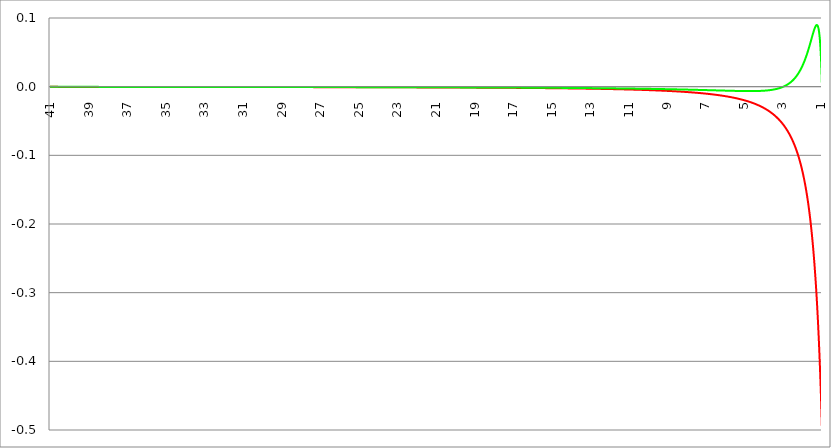
| Category | Series 1 | Series 0 | Series 2 |
|---|---|---|---|
| 41.0 | 0 | 0 |  |
| 40.98 | 0 | 0 |  |
| 40.96 | 0 | 0 |  |
| 40.94 | 0 | 0 |  |
| 40.91999999999999 | 0 | 0 |  |
| 40.89999999999998 | 0 | 0 |  |
| 40.87999999999998 | 0 | 0 |  |
| 40.85999999999998 | 0 | 0 |  |
| 40.83999999999997 | 0 | 0 |  |
| 40.81999999999997 | 0 | 0 |  |
| 40.79999999999996 | 0 | 0 |  |
| 40.77999999999996 | 0 | 0 |  |
| 40.75999999999996 | 0 | 0 |  |
| 40.73999999999995 | 0 | 0 |  |
| 40.71999999999995 | 0 | 0 |  |
| 40.69999999999995 | 0 | 0 |  |
| 40.67999999999994 | 0 | 0 |  |
| 40.65999999999994 | 0 | 0 |  |
| 40.63999999999994 | 0 | 0 |  |
| 40.61999999999994 | 0 | 0 |  |
| 40.59999999999993 | 0 | 0 |  |
| 40.57999999999993 | 0 | 0 |  |
| 40.55999999999993 | 0 | 0 |  |
| 40.53999999999992 | 0 | 0 |  |
| 40.51999999999992 | 0 | 0 |  |
| 40.49999999999992 | 0 | 0 |  |
| 40.47999999999992 | 0 | 0 |  |
| 40.45999999999992 | 0 | 0 |  |
| 40.43999999999991 | 0 | 0 |  |
| 40.41999999999991 | 0 | 0 |  |
| 40.3999999999999 | 0 | 0 |  |
| 40.3799999999999 | 0 | 0 |  |
| 40.3599999999999 | 0 | 0 |  |
| 40.3399999999999 | 0 | 0 |  |
| 40.3199999999999 | 0 | 0 |  |
| 40.2999999999999 | 0 | 0 |  |
| 40.27999999999988 | 0 | 0 |  |
| 40.25999999999988 | 0 | 0 |  |
| 40.23999999999988 | 0 | 0 |  |
| 40.21999999999987 | 0 | 0 |  |
| 40.19999999999987 | 0 | 0 |  |
| 40.17999999999987 | 0 | 0 |  |
| 40.15999999999987 | 0 | 0 |  |
| 40.13999999999986 | 0 | 0 |  |
| 40.11999999999986 | 0 | 0 |  |
| 40.09999999999985 | 0 | 0 |  |
| 40.07999999999985 | 0 | 0 |  |
| 40.05999999999985 | 0 | 0 |  |
| 40.03999999999984 | 0 | 0 |  |
| 40.01999999999984 | 0 | 0 |  |
| 39.99999999999984 | 0 | 0 |  |
| 39.97999999999984 | 0 | 0 |  |
| 39.95999999999984 | 0 | 0 |  |
| 39.93999999999983 | 0 | 0 |  |
| 39.91999999999983 | 0 | 0 |  |
| 39.89999999999982 | 0 | 0 |  |
| 39.87999999999982 | 0 | 0 |  |
| 39.85999999999982 | 0 | 0 |  |
| 39.83999999999982 | 0 | 0 |  |
| 39.81999999999982 | 0 | 0 |  |
| 39.7999999999998 | 0 | 0 |  |
| 39.7799999999998 | 0 | 0 |  |
| 39.7599999999998 | 0 | 0 |  |
| 39.7399999999998 | 0 | 0 |  |
| 39.7199999999998 | 0 | 0 |  |
| 39.6999999999998 | 0 | 0 |  |
| 39.6799999999998 | 0 | 0 |  |
| 39.6599999999998 | 0 | 0 |  |
| 39.63999999999978 | 0 | 0 |  |
| 39.61999999999978 | 0 | 0 |  |
| 39.59999999999978 | 0 | 0 |  |
| 39.57999999999977 | 0 | 0 |  |
| 39.55999999999977 | 0 | 0 |  |
| 39.53999999999977 | 0 | 0 |  |
| 39.51999999999977 | 0 | 0 |  |
| 39.49999999999976 | 0 | 0 |  |
| 39.47999999999976 | 0 | 0 |  |
| 39.45999999999976 | 0 | 0 |  |
| 39.43999999999975 | 0 | 0 |  |
| 39.41999999999975 | 0 | 0 |  |
| 39.39999999999974 | 0 | 0 |  |
| 39.37999999999974 | 0 | 0 |  |
| 39.35999999999974 | 0 | 0 |  |
| 39.33999999999974 | 0 | 0 |  |
| 39.31999999999974 | 0 | 0 |  |
| 39.29999999999973 | 0 | 0 |  |
| 39.27999999999973 | 0 | 0 |  |
| 39.25999999999972 | 0 | 0 |  |
| 39.23999999999972 | 0 | 0 |  |
| 39.21999999999972 | 0 | 0 |  |
| 39.19999999999971 | 0 | 0 |  |
| 39.17999999999971 | 0 | 0 |  |
| 39.15999999999971 | 0 | 0 |  |
| 39.1399999999997 | 0 | 0 |  |
| 39.1199999999997 | 0 | 0 |  |
| 39.0999999999997 | 0 | 0 |  |
| 39.0799999999997 | 0 | 0 |  |
| 39.0599999999997 | 0 | 0 |  |
| 39.0399999999997 | 0 | 0 |  |
| 39.0199999999997 | 0 | 0 |  |
| 38.99999999999969 | 0 | 0 |  |
| 38.97999999999968 | 0 | 0 |  |
| 38.95999999999968 | 0 | 0 |  |
| 38.93999999999968 | 0 | 0 |  |
| 38.91999999999967 | 0 | 0 |  |
| 38.89999999999967 | 0 | 0 |  |
| 38.87999999999967 | 0 | 0 |  |
| 38.85999999999967 | 0 | 0 |  |
| 38.83999999999966 | 0 | 0 |  |
| 38.81999999999966 | 0 | 0 |  |
| 38.79999999999965 | 0 | 0 |  |
| 38.77999999999965 | 0 | 0 |  |
| 38.75999999999965 | 0 | 0 |  |
| 38.73999999999964 | 0 | 0 |  |
| 38.71999999999964 | 0 | 0 |  |
| 38.69999999999964 | 0 | 0 |  |
| 38.67999999999964 | 0 | 0 |  |
| 38.65999999999963 | 0 | 0 |  |
| 38.63999999999963 | 0 | 0 |  |
| 38.61999999999963 | 0 | 0 |  |
| 38.59999999999962 | 0 | 0 |  |
| 38.57999999999962 | 0 | 0 |  |
| 38.55999999999962 | 0 | 0 |  |
| 38.53999999999962 | 0 | 0 |  |
| 38.51999999999961 | 0 | 0 |  |
| 38.49999999999961 | 0 | 0 |  |
| 38.47999999999961 | 0 | 0 |  |
| 38.4599999999996 | 0 | 0 |  |
| 38.4399999999996 | 0 | 0 |  |
| 38.4199999999996 | 0 | 0 |  |
| 38.3999999999996 | 0 | 0 |  |
| 38.3799999999996 | 0 | 0 |  |
| 38.35999999999959 | 0 | 0 |  |
| 38.33999999999958 | 0 | 0 |  |
| 38.31999999999958 | 0 | 0 |  |
| 38.29999999999957 | 0 | 0 |  |
| 38.27999999999957 | 0 | 0 |  |
| 38.25999999999957 | 0 | 0 |  |
| 38.23999999999957 | 0 | 0 |  |
| 38.21999999999957 | 0 | 0 |  |
| 38.19999999999956 | 0 | 0 |  |
| 38.17999999999956 | 0 | 0 |  |
| 38.15999999999956 | 0 | 0 |  |
| 38.13999999999955 | 0 | 0 |  |
| 38.11999999999955 | 0 | 0 |  |
| 38.09999999999954 | 0 | 0 |  |
| 38.07999999999954 | 0 | 0 |  |
| 38.05999999999954 | 0 | 0 |  |
| 38.03999999999954 | 0 | 0 |  |
| 38.01999999999953 | 0 | 0 |  |
| 37.99999999999953 | 0 | 0 |  |
| 37.97999999999953 | 0 | 0 |  |
| 37.95999999999952 | 0 | 0 |  |
| 37.93999999999952 | 0 | 0 |  |
| 37.91999999999952 | 0 | 0 |  |
| 37.89999999999952 | 0 | 0 |  |
| 37.87999999999951 | 0 | 0 |  |
| 37.85999999999951 | 0 | 0 |  |
| 37.83999999999951 | 0 | 0 |  |
| 37.8199999999995 | 0 | 0 |  |
| 37.7999999999995 | 0 | 0 |  |
| 37.7799999999995 | 0 | 0 |  |
| 37.7599999999995 | 0 | 0 |  |
| 37.7399999999995 | 0 | 0 |  |
| 37.71999999999949 | 0 | 0 |  |
| 37.69999999999948 | 0 | 0 |  |
| 37.67999999999948 | 0 | 0 |  |
| 37.65999999999948 | 0 | 0 |  |
| 37.63999999999947 | 0 | 0 |  |
| 37.61999999999947 | 0 | 0 |  |
| 37.59999999999947 | 0 | 0 |  |
| 37.57999999999947 | 0 | 0 |  |
| 37.55999999999946 | 0 | 0 |  |
| 37.53999999999946 | 0 | 0 |  |
| 37.51999999999946 | 0 | 0 |  |
| 37.49999999999945 | 0 | 0 |  |
| 37.47999999999945 | 0 | 0 |  |
| 37.45999999999945 | 0 | 0 |  |
| 37.43999999999944 | 0 | 0 |  |
| 37.41999999999944 | 0 | 0 |  |
| 37.39999999999944 | 0 | 0 |  |
| 37.37999999999943 | 0 | 0 |  |
| 37.35999999999943 | 0 | 0 |  |
| 37.33999999999943 | 0 | 0 |  |
| 37.31999999999942 | 0 | 0 |  |
| 37.29999999999942 | 0 | 0 |  |
| 37.27999999999942 | 0 | 0 |  |
| 37.25999999999942 | 0 | 0 |  |
| 37.23999999999941 | 0 | 0 |  |
| 37.21999999999941 | 0 | 0 |  |
| 37.1999999999994 | 0 | 0 |  |
| 37.1799999999994 | 0 | 0 |  |
| 37.1599999999994 | 0 | 0 |  |
| 37.1399999999994 | 0 | 0 |  |
| 37.1199999999994 | 0 | 0 |  |
| 37.0999999999994 | 0 | 0 |  |
| 37.07999999999939 | 0 | 0 |  |
| 37.05999999999938 | 0 | 0 |  |
| 37.03999999999938 | 0 | 0 |  |
| 37.01999999999938 | 0 | 0 |  |
| 36.99999999999937 | 0 | 0 |  |
| 36.97999999999937 | 0 | 0 |  |
| 36.95999999999937 | 0 | 0 |  |
| 36.93999999999937 | 0 | 0 |  |
| 36.91999999999936 | 0 | 0 |  |
| 36.89999999999936 | 0 | 0 |  |
| 36.87999999999936 | 0 | 0 |  |
| 36.85999999999935 | 0 | 0 |  |
| 36.83999999999935 | 0 | 0 |  |
| 36.81999999999935 | 0 | 0 |  |
| 36.79999999999934 | 0 | 0 |  |
| 36.77999999999934 | 0 | 0 |  |
| 36.75999999999934 | 0 | 0 |  |
| 36.73999999999933 | 0 | 0 |  |
| 36.71999999999933 | 0 | 0 |  |
| 36.69999999999932 | 0 | 0 |  |
| 36.67999999999932 | 0 | 0 |  |
| 36.65999999999932 | 0 | 0 |  |
| 36.63999999999932 | 0 | 0 |  |
| 36.61999999999932 | 0 | 0 |  |
| 36.59999999999931 | 0 | 0 |  |
| 36.57999999999931 | 0 | 0 |  |
| 36.55999999999931 | 0 | 0 |  |
| 36.5399999999993 | 0 | 0 |  |
| 36.5199999999993 | 0 | 0 |  |
| 36.4999999999993 | 0 | 0 |  |
| 36.4799999999993 | 0 | 0 |  |
| 36.4599999999993 | 0 | 0 |  |
| 36.43999999999929 | 0 | 0 |  |
| 36.41999999999928 | 0 | 0 |  |
| 36.39999999999928 | 0 | 0 |  |
| 36.37999999999928 | 0 | 0 |  |
| 36.35999999999927 | 0 | 0 |  |
| 36.33999999999927 | 0 | 0 |  |
| 36.31999999999927 | 0 | 0 |  |
| 36.29999999999926 | 0 | 0 |  |
| 36.27999999999926 | 0 | 0 |  |
| 36.25999999999926 | 0 | 0 |  |
| 36.23999999999925 | 0 | 0 |  |
| 36.21999999999925 | 0 | 0 |  |
| 36.19999999999924 | 0 | 0 |  |
| 36.17999999999924 | 0 | 0 |  |
| 36.15999999999924 | 0 | 0 |  |
| 36.13999999999924 | 0 | 0 |  |
| 36.11999999999924 | 0 | 0 |  |
| 36.09999999999923 | 0 | 0 |  |
| 36.07999999999923 | 0 | 0 |  |
| 36.05999999999923 | 0 | 0 |  |
| 36.03999999999922 | 0 | 0 |  |
| 36.01999999999922 | 0 | 0 |  |
| 35.99999999999922 | 0 | 0 |  |
| 35.97999999999922 | 0 | 0 |  |
| 35.95999999999921 | 0 | 0 |  |
| 35.93999999999921 | 0 | 0 |  |
| 35.91999999999921 | 0 | 0 |  |
| 35.8999999999992 | 0 | 0 |  |
| 35.8799999999992 | 0 | 0 |  |
| 35.8599999999992 | 0 | 0 |  |
| 35.8399999999992 | 0 | 0 |  |
| 35.8199999999992 | 0 | 0 |  |
| 35.79999999999918 | 0 | 0 |  |
| 35.77999999999918 | 0 | 0 |  |
| 35.75999999999918 | 0 | 0 |  |
| 35.73999999999917 | 0 | 0 |  |
| 35.71999999999917 | 0 | 0 |  |
| 35.69999999999917 | 0 | 0 |  |
| 35.67999999999917 | 0 | 0 |  |
| 35.65999999999917 | 0 | 0 |  |
| 35.63999999999916 | 0 | 0 |  |
| 35.61999999999916 | 0 | 0 |  |
| 35.59999999999915 | 0 | 0 |  |
| 35.57999999999915 | 0 | 0 |  |
| 35.55999999999915 | 0 | 0 |  |
| 35.53999999999914 | 0 | 0 |  |
| 35.51999999999914 | 0 | 0 |  |
| 35.49999999999914 | 0 | 0 |  |
| 35.47999999999914 | 0 | 0 |  |
| 35.45999999999913 | 0 | 0 |  |
| 35.43999999999913 | 0 | 0 |  |
| 35.41999999999913 | 0 | 0 |  |
| 35.39999999999912 | 0 | 0 |  |
| 35.37999999999912 | 0 | 0 |  |
| 35.35999999999912 | 0 | 0 |  |
| 35.33999999999912 | 0 | 0 |  |
| 35.31999999999911 | 0 | 0 |  |
| 35.2999999999991 | 0 | 0 |  |
| 35.2799999999991 | 0 | 0 |  |
| 35.2599999999991 | 0 | 0 |  |
| 35.2399999999991 | 0 | 0 |  |
| 35.2199999999991 | 0 | 0 |  |
| 35.1999999999991 | 0 | 0 |  |
| 35.1799999999991 | 0 | 0 |  |
| 35.15999999999909 | 0 | 0 |  |
| 35.13999999999908 | 0 | 0 |  |
| 35.11999999999908 | 0 | 0 |  |
| 35.09999999999907 | 0 | 0 |  |
| 35.07999999999907 | 0 | 0 |  |
| 35.05999999999907 | 0 | 0 |  |
| 35.03999999999907 | 0 | 0 |  |
| 35.01999999999907 | 0 | 0 |  |
| 34.99999999999906 | 0 | 0 |  |
| 34.97999999999906 | 0 | 0 |  |
| 34.95999999999906 | 0 | 0 |  |
| 34.93999999999905 | 0 | 0 |  |
| 34.91999999999905 | 0 | 0 |  |
| 34.89999999999904 | 0 | 0 |  |
| 34.87999999999904 | 0 | 0 |  |
| 34.85999999999904 | 0 | 0 |  |
| 34.83999999999904 | 0 | 0 |  |
| 34.81999999999903 | 0 | 0 |  |
| 34.79999999999903 | 0 | 0 |  |
| 34.77999999999902 | 0 | 0 |  |
| 34.75999999999902 | 0 | 0 |  |
| 34.73999999999902 | 0 | 0 |  |
| 34.71999999999902 | 0 | 0 |  |
| 34.69999999999901 | 0 | 0 |  |
| 34.67999999999901 | 0 | 0 |  |
| 34.65999999999901 | 0 | 0 |  |
| 34.639999999999 | 0 | 0 |  |
| 34.619999999999 | 0 | 0 |  |
| 34.599999999999 | 0 | 0 |  |
| 34.579999999999 | 0 | 0 |  |
| 34.559999999999 | 0 | 0 |  |
| 34.539999999999 | 0 | 0 |  |
| 34.51999999999899 | 0 | 0 |  |
| 34.49999999999898 | 0 | 0 |  |
| 34.47999999999898 | 0 | 0 |  |
| 34.45999999999898 | 0 | 0 |  |
| 34.43999999999897 | 0 | 0 |  |
| 34.41999999999897 | 0 | 0 |  |
| 34.39999999999897 | 0 | 0 |  |
| 34.37999999999897 | 0 | 0 |  |
| 34.35999999999896 | 0 | 0 |  |
| 34.33999999999896 | 0 | 0 |  |
| 34.31999999999896 | 0 | 0 |  |
| 34.29999999999895 | 0 | 0 |  |
| 34.27999999999894 | 0 | 0 |  |
| 34.25999999999894 | 0 | 0 |  |
| 34.23999999999894 | 0 | 0 |  |
| 34.21999999999894 | 0 | 0 |  |
| 34.19999999999893 | 0 | 0 |  |
| 34.17999999999893 | 0 | 0 |  |
| 34.15999999999893 | 0 | 0 |  |
| 34.13999999999892 | 0 | 0 |  |
| 34.11999999999892 | 0 | 0 |  |
| 34.09999999999892 | 0 | 0 |  |
| 34.07999999999892 | 0 | 0 |  |
| 34.05999999999892 | 0 | 0 |  |
| 34.03999999999891 | 0 | 0 |  |
| 34.01999999999891 | 0 | 0 |  |
| 33.9999999999989 | 0 | 0 |  |
| 33.9799999999989 | 0 | 0 |  |
| 33.9599999999989 | 0 | 0 |  |
| 33.9399999999989 | 0 | 0 |  |
| 33.9199999999989 | 0 | 0 |  |
| 33.8999999999989 | 0 | 0 |  |
| 33.87999999999889 | 0 | 0 |  |
| 33.85999999999888 | 0 | 0 |  |
| 33.83999999999888 | 0 | 0 |  |
| 33.81999999999888 | 0 | 0 |  |
| 33.79999999999887 | 0 | 0 |  |
| 33.77999999999887 | 0 | 0 |  |
| 33.75999999999887 | 0 | 0 |  |
| 33.73999999999886 | 0 | 0 |  |
| 33.71999999999886 | 0 | 0 |  |
| 33.69999999999885 | 0 | 0 |  |
| 33.67999999999885 | 0 | 0 |  |
| 33.65999999999885 | 0 | 0 |  |
| 33.63999999999884 | 0 | 0 |  |
| 33.61999999999884 | 0 | 0 |  |
| 33.59999999999884 | 0 | 0 |  |
| 33.57999999999884 | 0 | 0 |  |
| 33.55999999999884 | 0 | 0 |  |
| 33.53999999999883 | 0 | 0 |  |
| 33.51999999999883 | 0 | 0 |  |
| 33.49999999999882 | 0 | 0 |  |
| 33.47999999999882 | 0 | 0 |  |
| 33.45999999999882 | 0 | 0 |  |
| 33.43999999999882 | 0 | 0 |  |
| 33.41999999999882 | 0 | 0 |  |
| 33.39999999999881 | 0 | 0 |  |
| 33.37999999999881 | 0 | 0 |  |
| 33.35999999999881 | 0 | 0 |  |
| 33.3399999999988 | 0 | 0 |  |
| 33.3199999999988 | 0 | 0 |  |
| 33.2999999999988 | 0 | 0 |  |
| 33.2799999999988 | 0 | 0 |  |
| 33.2599999999988 | 0 | 0 |  |
| 33.23999999999878 | 0 | 0 |  |
| 33.21999999999878 | 0 | 0 |  |
| 33.19999999999878 | 0 | 0 |  |
| 33.17999999999877 | 0 | 0 |  |
| 33.15999999999877 | 0 | 0 |  |
| 33.13999999999877 | 0 | 0 |  |
| 33.11999999999877 | 0 | 0 |  |
| 33.09999999999876 | 0 | 0 |  |
| 33.07999999999876 | 0 | 0 |  |
| 33.05999999999876 | 0 | 0 |  |
| 33.03999999999875 | 0 | 0 |  |
| 33.01999999999875 | 0 | 0 |  |
| 32.99999999999874 | 0 | 0 |  |
| 32.97999999999874 | 0 | 0 |  |
| 32.95999999999874 | 0 | 0 |  |
| 32.93999999999874 | 0 | 0 |  |
| 32.91999999999874 | 0 | 0 |  |
| 32.89999999999873 | 0 | 0 |  |
| 32.87999999999873 | 0 | 0 |  |
| 32.85999999999873 | 0 | 0 |  |
| 32.83999999999872 | 0 | 0 |  |
| 32.81999999999872 | 0 | 0 |  |
| 32.79999999999871 | 0 | 0 |  |
| 32.77999999999871 | 0 | 0 |  |
| 32.75999999999871 | 0 | 0 |  |
| 32.7399999999987 | 0 | 0 |  |
| 32.7199999999987 | 0 | 0 |  |
| 32.6999999999987 | 0 | 0 |  |
| 32.6799999999987 | 0 | 0 |  |
| 32.6599999999987 | 0 | 0 |  |
| 32.6399999999987 | 0 | 0 |  |
| 32.61999999999869 | 0 | 0 |  |
| 32.59999999999869 | 0 | 0 |  |
| 32.57999999999868 | 0 | 0 |  |
| 32.55999999999868 | 0 | 0 |  |
| 32.53999999999868 | 0 | 0 |  |
| 32.51999999999867 | 0 | 0 |  |
| 32.49999999999867 | 0 | 0 |  |
| 32.47999999999867 | 0 | 0 |  |
| 32.45999999999866 | 0 | 0 |  |
| 32.43999999999866 | 0 | 0 |  |
| 32.41999999999866 | 0 | 0 |  |
| 32.39999999999866 | 0 | 0 |  |
| 32.37999999999865 | 0 | 0 |  |
| 32.35999999999865 | 0 | 0 |  |
| 32.33999999999865 | 0 | 0 |  |
| 32.31999999999864 | 0 | 0 |  |
| 32.29999999999864 | 0 | 0 |  |
| 32.27999999999864 | 0 | 0 |  |
| 32.25999999999863 | 0 | 0 |  |
| 32.23999999999863 | 0 | 0 |  |
| 32.21999999999863 | 0 | 0 |  |
| 32.19999999999862 | 0 | 0 |  |
| 32.17999999999862 | 0 | 0 |  |
| 32.15999999999862 | 0 | 0 |  |
| 32.13999999999861 | 0 | 0 |  |
| 32.11999999999861 | 0 | 0 |  |
| 32.09999999999861 | 0 | 0 |  |
| 32.07999999999861 | 0 | 0 |  |
| 32.0599999999986 | 0 | 0 |  |
| 32.0399999999986 | 0 | 0 |  |
| 32.0199999999986 | 0 | 0 |  |
| 31.9999999999986 | 0 | 0 |  |
| 31.9799999999986 | 0 | 0 |  |
| 31.9599999999986 | 0 | 0 |  |
| 31.9399999999986 | 0 | 0 |  |
| 31.9199999999986 | 0 | 0 |  |
| 31.8999999999986 | 0 | 0 |  |
| 31.8799999999986 | 0 | 0 |  |
| 31.8599999999986 | 0 | 0 |  |
| 31.8399999999986 | 0 | 0 |  |
| 31.8199999999986 | 0 | 0 |  |
| 31.7999999999986 | 0 | 0 |  |
| 31.7799999999986 | 0 | 0 |  |
| 31.7599999999986 | 0 | 0 |  |
| 31.7399999999986 | 0 | 0 |  |
| 31.7199999999986 | 0 | 0 |  |
| 31.6999999999986 | 0 | 0 |  |
| 31.6799999999986 | 0 | 0 |  |
| 31.6599999999986 | 0 | 0 |  |
| 31.6399999999986 | 0 | 0 |  |
| 31.6199999999986 | -0.001 | 0 |  |
| 31.59999999999861 | -0.001 | 0 |  |
| 31.57999999999861 | -0.001 | 0 |  |
| 31.55999999999861 | -0.001 | 0 |  |
| 31.53999999999861 | -0.001 | 0 |  |
| 31.51999999999861 | -0.001 | 0 |  |
| 31.49999999999861 | -0.001 | 0 |  |
| 31.47999999999861 | -0.001 | 0 |  |
| 31.45999999999861 | -0.001 | 0 |  |
| 31.43999999999861 | -0.001 | 0 |  |
| 31.41999999999861 | -0.001 | 0 |  |
| 31.39999999999861 | -0.001 | 0 |  |
| 31.37999999999861 | -0.001 | 0 |  |
| 31.35999999999861 | -0.001 | 0 |  |
| 31.33999999999861 | -0.001 | 0 |  |
| 31.31999999999861 | -0.001 | 0 |  |
| 31.29999999999861 | -0.001 | 0 |  |
| 31.27999999999861 | -0.001 | 0 |  |
| 31.25999999999861 | -0.001 | 0 |  |
| 31.23999999999861 | -0.001 | 0 |  |
| 31.21999999999861 | -0.001 | 0 |  |
| 31.19999999999861 | -0.001 | 0 |  |
| 31.17999999999861 | -0.001 | 0 |  |
| 31.15999999999861 | -0.001 | 0 |  |
| 31.13999999999861 | -0.001 | 0 |  |
| 31.11999999999861 | -0.001 | 0 |  |
| 31.09999999999862 | -0.001 | 0 |  |
| 31.07999999999862 | -0.001 | 0 |  |
| 31.05999999999862 | -0.001 | 0 |  |
| 31.03999999999862 | -0.001 | 0 |  |
| 31.01999999999862 | -0.001 | 0 |  |
| 30.99999999999862 | -0.001 | 0 |  |
| 30.97999999999862 | -0.001 | 0 |  |
| 30.95999999999862 | -0.001 | 0 |  |
| 30.93999999999862 | -0.001 | 0 |  |
| 30.91999999999862 | -0.001 | 0 |  |
| 30.89999999999862 | -0.001 | 0 |  |
| 30.87999999999862 | -0.001 | 0 |  |
| 30.85999999999862 | -0.001 | 0 |  |
| 30.83999999999862 | -0.001 | 0 |  |
| 30.81999999999862 | -0.001 | 0 |  |
| 30.79999999999862 | -0.001 | 0 |  |
| 30.77999999999862 | -0.001 | 0 |  |
| 30.75999999999862 | -0.001 | 0 |  |
| 30.73999999999862 | -0.001 | 0 |  |
| 30.71999999999862 | -0.001 | 0 |  |
| 30.69999999999862 | -0.001 | 0 |  |
| 30.67999999999862 | -0.001 | 0 |  |
| 30.65999999999862 | -0.001 | 0 |  |
| 30.63999999999862 | -0.001 | 0 |  |
| 30.61999999999862 | -0.001 | 0 |  |
| 30.59999999999863 | -0.001 | 0 |  |
| 30.57999999999863 | -0.001 | 0 |  |
| 30.55999999999863 | -0.001 | 0 |  |
| 30.53999999999863 | -0.001 | 0 |  |
| 30.51999999999863 | -0.001 | 0 |  |
| 30.49999999999863 | -0.001 | 0 |  |
| 30.47999999999863 | -0.001 | 0 |  |
| 30.45999999999863 | -0.001 | 0 |  |
| 30.43999999999863 | -0.001 | 0 |  |
| 30.41999999999863 | -0.001 | 0 |  |
| 30.39999999999863 | -0.001 | 0 |  |
| 30.37999999999863 | -0.001 | 0 |  |
| 30.35999999999863 | -0.001 | 0 |  |
| 30.33999999999863 | -0.001 | 0 |  |
| 30.31999999999863 | -0.001 | 0 |  |
| 30.29999999999863 | -0.001 | 0 |  |
| 30.27999999999863 | -0.001 | 0 |  |
| 30.25999999999863 | -0.001 | 0 |  |
| 30.23999999999863 | -0.001 | 0 |  |
| 30.21999999999863 | -0.001 | 0 |  |
| 30.19999999999864 | -0.001 | 0 |  |
| 30.17999999999864 | -0.001 | 0 |  |
| 30.15999999999864 | -0.001 | 0 |  |
| 30.13999999999864 | -0.001 | 0 |  |
| 30.11999999999864 | -0.001 | 0 |  |
| 30.09999999999864 | -0.001 | 0 |  |
| 30.07999999999864 | -0.001 | 0 |  |
| 30.05999999999864 | -0.001 | 0 |  |
| 30.03999999999864 | -0.001 | 0 |  |
| 30.01999999999864 | -0.001 | 0 |  |
| 29.99999999999864 | -0.001 | 0 |  |
| 29.97999999999864 | -0.001 | 0 |  |
| 29.95999999999864 | -0.001 | 0 |  |
| 29.93999999999864 | -0.001 | 0 |  |
| 29.91999999999864 | -0.001 | 0 |  |
| 29.89999999999864 | -0.001 | 0 |  |
| 29.87999999999864 | -0.001 | 0 |  |
| 29.85999999999864 | -0.001 | 0 |  |
| 29.83999999999864 | -0.001 | 0 |  |
| 29.81999999999864 | -0.001 | 0 |  |
| 29.79999999999864 | -0.001 | 0 |  |
| 29.77999999999864 | -0.001 | 0 |  |
| 29.75999999999864 | -0.001 | 0 |  |
| 29.73999999999864 | -0.001 | 0 |  |
| 29.71999999999865 | -0.001 | 0 |  |
| 29.69999999999865 | -0.001 | 0 |  |
| 29.67999999999865 | -0.001 | 0 |  |
| 29.65999999999865 | -0.001 | 0 |  |
| 29.63999999999865 | -0.001 | 0 |  |
| 29.61999999999865 | -0.001 | 0 |  |
| 29.59999999999865 | -0.001 | 0 |  |
| 29.57999999999865 | -0.001 | 0 |  |
| 29.55999999999865 | -0.001 | 0 |  |
| 29.53999999999865 | -0.001 | 0 |  |
| 29.51999999999865 | -0.001 | 0 |  |
| 29.49999999999865 | -0.001 | 0 |  |
| 29.47999999999865 | -0.001 | 0 |  |
| 29.45999999999865 | -0.001 | 0 |  |
| 29.43999999999865 | -0.001 | -0.001 |  |
| 29.41999999999865 | -0.001 | -0.001 |  |
| 29.39999999999865 | -0.001 | -0.001 |  |
| 29.37999999999865 | -0.001 | -0.001 |  |
| 29.35999999999865 | -0.001 | -0.001 |  |
| 29.33999999999865 | -0.001 | -0.001 |  |
| 29.31999999999865 | -0.001 | -0.001 |  |
| 29.29999999999865 | -0.001 | -0.001 |  |
| 29.27999999999865 | -0.001 | -0.001 |  |
| 29.25999999999866 | -0.001 | -0.001 |  |
| 29.23999999999866 | -0.001 | -0.001 |  |
| 29.21999999999866 | -0.001 | -0.001 |  |
| 29.19999999999866 | -0.001 | -0.001 |  |
| 29.17999999999866 | -0.001 | -0.001 |  |
| 29.15999999999866 | -0.001 | -0.001 |  |
| 29.13999999999866 | -0.001 | -0.001 |  |
| 29.11999999999866 | -0.001 | -0.001 |  |
| 29.09999999999866 | -0.001 | -0.001 |  |
| 29.07999999999866 | -0.001 | -0.001 |  |
| 29.05999999999866 | -0.001 | -0.001 |  |
| 29.03999999999866 | -0.001 | -0.001 |  |
| 29.01999999999866 | -0.001 | -0.001 |  |
| 28.99999999999866 | -0.001 | -0.001 |  |
| 28.97999999999866 | -0.001 | -0.001 |  |
| 28.95999999999866 | -0.001 | -0.001 |  |
| 28.93999999999866 | -0.001 | -0.001 |  |
| 28.91999999999866 | -0.001 | -0.001 |  |
| 28.89999999999866 | -0.001 | -0.001 |  |
| 28.87999999999866 | -0.001 | -0.001 |  |
| 28.85999999999866 | -0.001 | -0.001 |  |
| 28.83999999999866 | -0.001 | -0.001 |  |
| 28.81999999999866 | -0.001 | -0.001 |  |
| 28.79999999999866 | -0.001 | -0.001 |  |
| 28.77999999999867 | -0.001 | -0.001 |  |
| 28.75999999999867 | -0.001 | -0.001 |  |
| 28.73999999999867 | -0.001 | -0.001 |  |
| 28.71999999999867 | -0.001 | -0.001 |  |
| 28.69999999999867 | -0.001 | -0.001 |  |
| 28.67999999999867 | -0.001 | -0.001 |  |
| 28.65999999999867 | -0.001 | -0.001 |  |
| 28.63999999999867 | -0.001 | -0.001 |  |
| 28.61999999999867 | -0.001 | -0.001 |  |
| 28.59999999999867 | -0.001 | -0.001 |  |
| 28.57999999999867 | -0.001 | -0.001 |  |
| 28.55999999999867 | -0.001 | -0.001 |  |
| 28.53999999999867 | -0.001 | -0.001 |  |
| 28.51999999999867 | -0.001 | -0.001 |  |
| 28.49999999999867 | -0.001 | -0.001 |  |
| 28.47999999999867 | -0.001 | -0.001 |  |
| 28.45999999999867 | -0.001 | -0.001 |  |
| 28.43999999999867 | -0.001 | -0.001 |  |
| 28.41999999999867 | -0.001 | -0.001 |  |
| 28.39999999999867 | -0.001 | -0.001 |  |
| 28.37999999999867 | -0.001 | -0.001 |  |
| 28.35999999999867 | -0.001 | -0.001 |  |
| 28.33999999999867 | -0.001 | -0.001 |  |
| 28.31999999999867 | -0.001 | -0.001 |  |
| 28.29999999999868 | -0.001 | -0.001 |  |
| 28.27999999999868 | -0.001 | -0.001 |  |
| 28.25999999999868 | -0.001 | -0.001 |  |
| 28.23999999999868 | -0.001 | -0.001 |  |
| 28.21999999999868 | -0.001 | -0.001 |  |
| 28.19999999999868 | -0.001 | -0.001 |  |
| 28.17999999999868 | -0.001 | -0.001 |  |
| 28.15999999999868 | -0.001 | -0.001 |  |
| 28.13999999999868 | -0.001 | -0.001 |  |
| 28.11999999999868 | -0.001 | -0.001 |  |
| 28.09999999999868 | -0.001 | -0.001 |  |
| 28.07999999999868 | -0.001 | -0.001 |  |
| 28.05999999999868 | -0.001 | -0.001 |  |
| 28.03999999999868 | -0.001 | -0.001 |  |
| 28.01999999999868 | -0.001 | -0.001 |  |
| 27.99999999999868 | -0.001 | -0.001 |  |
| 27.97999999999868 | -0.001 | -0.001 |  |
| 27.95999999999868 | -0.001 | -0.001 |  |
| 27.93999999999868 | -0.001 | -0.001 |  |
| 27.91999999999868 | -0.001 | -0.001 |  |
| 27.89999999999868 | -0.001 | -0.001 |  |
| 27.87999999999868 | -0.001 | -0.001 |  |
| 27.85999999999868 | -0.001 | -0.001 |  |
| 27.83999999999868 | -0.001 | -0.001 |  |
| 27.81999999999868 | -0.001 | -0.001 |  |
| 27.79999999999869 | -0.001 | -0.001 |  |
| 27.77999999999869 | -0.001 | -0.001 |  |
| 27.75999999999869 | -0.001 | -0.001 |  |
| 27.73999999999869 | -0.001 | -0.001 |  |
| 27.71999999999869 | -0.001 | -0.001 |  |
| 27.69999999999869 | -0.001 | -0.001 |  |
| 27.67999999999869 | -0.001 | -0.001 |  |
| 27.65999999999869 | -0.001 | -0.001 |  |
| 27.63999999999869 | -0.001 | -0.001 |  |
| 27.61999999999869 | -0.001 | -0.001 |  |
| 27.5999999999987 | -0.001 | -0.001 |  |
| 27.5799999999987 | -0.001 | -0.001 |  |
| 27.5599999999987 | -0.001 | -0.001 |  |
| 27.5399999999987 | -0.001 | -0.001 |  |
| 27.5199999999987 | -0.001 | -0.001 |  |
| 27.49999999999869 | -0.001 | -0.001 |  |
| 27.47999999999869 | -0.001 | -0.001 |  |
| 27.45999999999869 | -0.001 | -0.001 |  |
| 27.43999999999869 | -0.001 | -0.001 |  |
| 27.41999999999869 | -0.001 | -0.001 |  |
| 27.39999999999869 | -0.001 | -0.001 |  |
| 27.3799999999987 | -0.001 | -0.001 |  |
| 27.3599999999987 | -0.001 | -0.001 |  |
| 27.3399999999987 | -0.001 | -0.001 |  |
| 27.3199999999987 | -0.001 | -0.001 |  |
| 27.2999999999987 | -0.001 | -0.001 |  |
| 27.2799999999987 | -0.001 | -0.001 |  |
| 27.2599999999987 | -0.001 | -0.001 |  |
| 27.2399999999987 | -0.001 | -0.001 |  |
| 27.2199999999987 | -0.001 | -0.001 |  |
| 27.1999999999987 | -0.001 | -0.001 |  |
| 27.1799999999987 | -0.001 | -0.001 |  |
| 27.1599999999987 | -0.001 | -0.001 |  |
| 27.1399999999987 | -0.001 | -0.001 |  |
| 27.1199999999987 | -0.001 | -0.001 |  |
| 27.0999999999987 | -0.001 | -0.001 |  |
| 27.0799999999987 | -0.001 | -0.001 |  |
| 27.0599999999987 | -0.001 | -0.001 |  |
| 27.0399999999987 | -0.001 | -0.001 |  |
| 27.0199999999987 | -0.001 | -0.001 |  |
| 26.9999999999987 | -0.001 | -0.001 |  |
| 26.9799999999987 | -0.001 | -0.001 |  |
| 26.9599999999987 | -0.001 | -0.001 |  |
| 26.9399999999987 | -0.001 | -0.001 |  |
| 26.9199999999987 | -0.001 | -0.001 |  |
| 26.89999999999871 | -0.001 | -0.001 |  |
| 26.87999999999871 | -0.001 | -0.001 |  |
| 26.85999999999871 | -0.001 | -0.001 |  |
| 26.83999999999871 | -0.001 | -0.001 |  |
| 26.81999999999871 | -0.001 | -0.001 |  |
| 26.79999999999871 | -0.001 | -0.001 |  |
| 26.77999999999871 | -0.001 | -0.001 |  |
| 26.75999999999871 | -0.001 | -0.001 |  |
| 26.73999999999871 | -0.001 | -0.001 |  |
| 26.71999999999871 | -0.001 | -0.001 |  |
| 26.69999999999871 | -0.001 | -0.001 |  |
| 26.67999999999871 | -0.001 | -0.001 |  |
| 26.65999999999871 | -0.001 | -0.001 |  |
| 26.63999999999871 | -0.001 | -0.001 |  |
| 26.61999999999871 | -0.001 | -0.001 |  |
| 26.59999999999871 | -0.001 | -0.001 |  |
| 26.57999999999871 | -0.001 | -0.001 |  |
| 26.55999999999871 | -0.001 | -0.001 |  |
| 26.53999999999871 | -0.001 | -0.001 |  |
| 26.51999999999871 | -0.001 | -0.001 |  |
| 26.49999999999871 | -0.001 | -0.001 |  |
| 26.47999999999871 | -0.001 | -0.001 |  |
| 26.45999999999871 | -0.001 | -0.001 |  |
| 26.43999999999872 | -0.001 | -0.001 |  |
| 26.41999999999872 | -0.001 | -0.001 |  |
| 26.39999999999872 | -0.001 | -0.001 |  |
| 26.37999999999872 | -0.001 | -0.001 |  |
| 26.35999999999872 | -0.001 | -0.001 |  |
| 26.33999999999872 | -0.001 | -0.001 |  |
| 26.31999999999872 | -0.001 | -0.001 |  |
| 26.29999999999872 | -0.001 | -0.001 |  |
| 26.27999999999872 | -0.001 | -0.001 |  |
| 26.25999999999872 | -0.001 | -0.001 |  |
| 26.23999999999872 | -0.001 | -0.001 |  |
| 26.21999999999872 | -0.001 | -0.001 |  |
| 26.19999999999872 | -0.001 | -0.001 |  |
| 26.17999999999872 | -0.001 | -0.001 |  |
| 26.15999999999872 | -0.001 | -0.001 |  |
| 26.13999999999872 | -0.001 | -0.001 |  |
| 26.11999999999872 | -0.001 | -0.001 |  |
| 26.09999999999872 | -0.001 | -0.001 |  |
| 26.07999999999872 | -0.001 | -0.001 |  |
| 26.05999999999872 | -0.001 | -0.001 |  |
| 26.03999999999872 | -0.001 | -0.001 |  |
| 26.01999999999872 | -0.001 | -0.001 |  |
| 25.99999999999872 | -0.001 | -0.001 |  |
| 25.97999999999872 | -0.001 | -0.001 |  |
| 25.95999999999873 | -0.001 | -0.001 |  |
| 25.93999999999873 | -0.001 | -0.001 |  |
| 25.91999999999873 | -0.001 | -0.001 |  |
| 25.89999999999873 | -0.001 | -0.001 |  |
| 25.87999999999873 | -0.001 | -0.001 |  |
| 25.85999999999873 | -0.001 | -0.001 |  |
| 25.83999999999873 | -0.001 | -0.001 |  |
| 25.81999999999873 | -0.001 | -0.001 |  |
| 25.79999999999873 | -0.001 | -0.001 |  |
| 25.77999999999873 | -0.001 | -0.001 |  |
| 25.75999999999873 | -0.001 | -0.001 |  |
| 25.73999999999873 | -0.001 | -0.001 |  |
| 25.71999999999873 | -0.001 | -0.001 |  |
| 25.69999999999873 | -0.001 | -0.001 |  |
| 25.67999999999873 | -0.001 | -0.001 |  |
| 25.65999999999873 | -0.001 | -0.001 |  |
| 25.63999999999873 | -0.001 | -0.001 |  |
| 25.61999999999873 | -0.001 | -0.001 |  |
| 25.59999999999873 | -0.001 | -0.001 |  |
| 25.57999999999873 | -0.001 | -0.001 |  |
| 25.55999999999873 | -0.001 | -0.001 |  |
| 25.53999999999873 | -0.001 | -0.001 |  |
| 25.51999999999873 | -0.001 | -0.001 |  |
| 25.49999999999874 | -0.001 | -0.001 |  |
| 25.47999999999874 | -0.001 | -0.001 |  |
| 25.45999999999874 | -0.001 | -0.001 |  |
| 25.43999999999874 | -0.001 | -0.001 |  |
| 25.41999999999874 | -0.001 | -0.001 |  |
| 25.39999999999874 | -0.001 | -0.001 |  |
| 25.37999999999874 | -0.001 | -0.001 |  |
| 25.35999999999874 | -0.001 | -0.001 |  |
| 25.33999999999874 | -0.001 | -0.001 |  |
| 25.31999999999874 | -0.001 | -0.001 |  |
| 25.29999999999874 | -0.001 | -0.001 |  |
| 25.27999999999874 | -0.001 | -0.001 |  |
| 25.25999999999874 | -0.001 | -0.001 |  |
| 25.23999999999874 | -0.001 | -0.001 |  |
| 25.21999999999874 | -0.001 | -0.001 |  |
| 25.19999999999874 | -0.001 | -0.001 |  |
| 25.17999999999874 | -0.001 | -0.001 |  |
| 25.15999999999874 | -0.001 | -0.001 |  |
| 25.13999999999874 | -0.001 | -0.001 |  |
| 25.11999999999874 | -0.001 | -0.001 |  |
| 25.09999999999874 | -0.001 | -0.001 |  |
| 25.07999999999874 | -0.001 | -0.001 |  |
| 25.05999999999874 | -0.001 | -0.001 |  |
| 25.03999999999875 | -0.001 | -0.001 |  |
| 25.01999999999875 | -0.001 | -0.001 |  |
| 24.99999999999875 | -0.001 | -0.001 |  |
| 24.97999999999875 | -0.001 | -0.001 |  |
| 24.95999999999875 | -0.001 | -0.001 |  |
| 24.93999999999875 | -0.001 | -0.001 |  |
| 24.91999999999875 | -0.001 | -0.001 |  |
| 24.89999999999875 | -0.001 | -0.001 |  |
| 24.87999999999875 | -0.001 | -0.001 |  |
| 24.85999999999875 | -0.001 | -0.001 |  |
| 24.83999999999875 | -0.001 | -0.001 |  |
| 24.81999999999875 | -0.001 | -0.001 |  |
| 24.79999999999875 | -0.001 | -0.001 |  |
| 24.77999999999875 | -0.001 | -0.001 |  |
| 24.75999999999875 | -0.001 | -0.001 |  |
| 24.73999999999875 | -0.001 | -0.001 |  |
| 24.71999999999875 | -0.001 | -0.001 |  |
| 24.69999999999875 | -0.001 | -0.001 |  |
| 24.67999999999875 | -0.001 | -0.001 |  |
| 24.65999999999875 | -0.001 | -0.001 |  |
| 24.63999999999875 | -0.001 | -0.001 |  |
| 24.61999999999875 | -0.001 | -0.001 |  |
| 24.59999999999875 | -0.001 | -0.001 |  |
| 24.57999999999875 | -0.001 | -0.001 |  |
| 24.55999999999876 | -0.001 | -0.001 |  |
| 24.53999999999876 | -0.001 | -0.001 |  |
| 24.51999999999876 | -0.001 | -0.001 |  |
| 24.49999999999876 | -0.001 | -0.001 |  |
| 24.47999999999876 | -0.001 | -0.001 |  |
| 24.45999999999876 | -0.001 | -0.001 |  |
| 24.43999999999876 | -0.001 | -0.001 |  |
| 24.41999999999876 | -0.001 | -0.001 |  |
| 24.39999999999876 | -0.001 | -0.001 |  |
| 24.37999999999876 | -0.001 | -0.001 |  |
| 24.35999999999876 | -0.001 | -0.001 |  |
| 24.33999999999876 | -0.001 | -0.001 |  |
| 24.31999999999876 | -0.001 | -0.001 |  |
| 24.29999999999876 | -0.001 | -0.001 |  |
| 24.27999999999876 | -0.001 | -0.001 |  |
| 24.25999999999876 | -0.001 | -0.001 |  |
| 24.23999999999876 | -0.001 | -0.001 |  |
| 24.21999999999876 | -0.001 | -0.001 |  |
| 24.19999999999876 | -0.001 | -0.001 |  |
| 24.17999999999876 | -0.001 | -0.001 |  |
| 24.15999999999876 | -0.001 | -0.001 |  |
| 24.13999999999876 | -0.001 | -0.001 |  |
| 24.11999999999876 | -0.001 | -0.001 |  |
| 24.09999999999877 | -0.001 | -0.001 |  |
| 24.07999999999877 | -0.001 | -0.001 |  |
| 24.05999999999877 | -0.001 | -0.001 |  |
| 24.03999999999877 | -0.001 | -0.001 |  |
| 24.01999999999877 | -0.001 | -0.001 |  |
| 23.99999999999877 | -0.001 | -0.001 |  |
| 23.97999999999877 | -0.001 | -0.001 |  |
| 23.95999999999877 | -0.001 | -0.001 |  |
| 23.93999999999877 | -0.001 | -0.001 |  |
| 23.91999999999877 | -0.001 | -0.001 |  |
| 23.89999999999877 | -0.001 | -0.001 |  |
| 23.87999999999877 | -0.001 | -0.001 |  |
| 23.85999999999877 | -0.001 | -0.001 |  |
| 23.83999999999877 | -0.001 | -0.001 |  |
| 23.81999999999877 | -0.001 | -0.001 |  |
| 23.79999999999877 | -0.001 | -0.001 |  |
| 23.77999999999877 | -0.001 | -0.001 |  |
| 23.75999999999877 | -0.001 | -0.001 |  |
| 23.73999999999877 | -0.001 | -0.001 |  |
| 23.71999999999877 | -0.001 | -0.001 |  |
| 23.69999999999877 | -0.001 | -0.001 |  |
| 23.67999999999877 | -0.001 | -0.001 |  |
| 23.65999999999877 | -0.001 | -0.001 |  |
| 23.63999999999877 | -0.001 | -0.001 |  |
| 23.61999999999877 | -0.001 | -0.001 |  |
| 23.59999999999878 | -0.001 | -0.001 |  |
| 23.57999999999878 | -0.001 | -0.001 |  |
| 23.55999999999878 | -0.001 | -0.001 |  |
| 23.53999999999878 | -0.001 | -0.001 |  |
| 23.51999999999878 | -0.001 | -0.001 |  |
| 23.49999999999878 | -0.001 | -0.001 |  |
| 23.47999999999878 | -0.001 | -0.001 |  |
| 23.45999999999878 | -0.001 | -0.001 |  |
| 23.43999999999878 | -0.001 | -0.001 |  |
| 23.41999999999878 | -0.001 | -0.001 |  |
| 23.39999999999878 | -0.001 | -0.001 |  |
| 23.37999999999878 | -0.001 | -0.001 |  |
| 23.35999999999878 | -0.001 | -0.001 |  |
| 23.33999999999878 | -0.001 | -0.001 |  |
| 23.31999999999878 | -0.001 | -0.001 |  |
| 23.29999999999878 | -0.001 | -0.001 |  |
| 23.27999999999878 | -0.001 | -0.001 |  |
| 23.25999999999878 | -0.001 | -0.001 |  |
| 23.23999999999878 | -0.001 | -0.001 |  |
| 23.21999999999878 | -0.001 | -0.001 |  |
| 23.19999999999878 | -0.001 | -0.001 |  |
| 23.17999999999878 | -0.001 | -0.001 |  |
| 23.15999999999878 | -0.001 | -0.001 |  |
| 23.13999999999878 | -0.001 | -0.001 |  |
| 23.11999999999878 | -0.001 | -0.001 |  |
| 23.09999999999879 | -0.001 | -0.001 |  |
| 23.07999999999879 | -0.001 | -0.001 |  |
| 23.05999999999879 | -0.001 | -0.001 |  |
| 23.03999999999879 | -0.001 | -0.001 |  |
| 23.01999999999879 | -0.001 | -0.001 |  |
| 22.99999999999879 | -0.001 | -0.001 |  |
| 22.97999999999879 | -0.001 | -0.001 |  |
| 22.95999999999879 | -0.001 | -0.001 |  |
| 22.93999999999879 | -0.001 | -0.001 |  |
| 22.9199999999988 | -0.001 | -0.001 |  |
| 22.8999999999988 | -0.001 | -0.001 |  |
| 22.8799999999988 | -0.001 | -0.001 |  |
| 22.8599999999988 | -0.001 | -0.001 |  |
| 22.8399999999988 | -0.001 | -0.001 |  |
| 22.8199999999988 | -0.001 | -0.001 |  |
| 22.79999999999879 | -0.001 | -0.001 |  |
| 22.77999999999879 | -0.001 | -0.001 |  |
| 22.75999999999879 | -0.001 | -0.001 |  |
| 22.73999999999879 | -0.001 | -0.001 |  |
| 22.71999999999879 | -0.001 | -0.001 |  |
| 22.69999999999879 | -0.001 | -0.001 |  |
| 22.6799999999988 | -0.001 | -0.001 |  |
| 22.6599999999988 | -0.001 | -0.001 |  |
| 22.6399999999988 | -0.001 | -0.001 |  |
| 22.6199999999988 | -0.001 | -0.001 |  |
| 22.5999999999988 | -0.001 | -0.001 |  |
| 22.5799999999988 | -0.001 | -0.001 |  |
| 22.5599999999988 | -0.001 | -0.001 |  |
| 22.5399999999988 | -0.001 | -0.001 |  |
| 22.5199999999988 | -0.001 | -0.001 |  |
| 22.4999999999988 | -0.001 | -0.001 |  |
| 22.4799999999988 | -0.001 | -0.001 |  |
| 22.4599999999988 | -0.001 | -0.001 |  |
| 22.4399999999988 | -0.001 | -0.001 |  |
| 22.4199999999988 | -0.001 | -0.001 |  |
| 22.3999999999988 | -0.001 | -0.001 |  |
| 22.3799999999988 | -0.001 | -0.001 |  |
| 22.3599999999988 | -0.001 | -0.001 |  |
| 22.3399999999988 | -0.001 | -0.001 |  |
| 22.3199999999988 | -0.001 | -0.001 |  |
| 22.2999999999988 | -0.001 | -0.001 |  |
| 22.2799999999988 | -0.001 | -0.001 |  |
| 22.2599999999988 | -0.001 | -0.001 |  |
| 22.2399999999988 | -0.001 | -0.001 |  |
| 22.21999999999881 | -0.001 | -0.001 |  |
| 22.19999999999881 | -0.001 | -0.001 |  |
| 22.17999999999881 | -0.001 | -0.001 |  |
| 22.15999999999881 | -0.001 | -0.001 |  |
| 22.13999999999881 | -0.001 | -0.001 |  |
| 22.11999999999881 | -0.001 | -0.001 |  |
| 22.09999999999881 | -0.001 | -0.001 |  |
| 22.07999999999881 | -0.001 | -0.001 |  |
| 22.05999999999881 | -0.001 | -0.001 |  |
| 22.03999999999881 | -0.001 | -0.001 |  |
| 22.01999999999881 | -0.001 | -0.001 |  |
| 21.99999999999881 | -0.001 | -0.001 |  |
| 21.97999999999881 | -0.001 | -0.001 |  |
| 21.95999999999881 | -0.001 | -0.001 |  |
| 21.93999999999881 | -0.001 | -0.001 |  |
| 21.91999999999881 | -0.001 | -0.001 |  |
| 21.89999999999881 | -0.001 | -0.001 |  |
| 21.87999999999881 | -0.001 | -0.001 |  |
| 21.85999999999881 | -0.001 | -0.001 |  |
| 21.83999999999881 | -0.001 | -0.001 |  |
| 21.81999999999881 | -0.001 | -0.001 |  |
| 21.79999999999881 | -0.001 | -0.001 |  |
| 21.77999999999881 | -0.001 | -0.001 |  |
| 21.75999999999881 | -0.001 | -0.001 |  |
| 21.73999999999882 | -0.001 | -0.001 |  |
| 21.71999999999882 | -0.001 | -0.001 |  |
| 21.69999999999882 | -0.001 | -0.001 |  |
| 21.67999999999882 | -0.001 | -0.001 |  |
| 21.65999999999882 | -0.001 | -0.001 |  |
| 21.63999999999882 | -0.001 | -0.001 |  |
| 21.61999999999882 | -0.001 | -0.001 |  |
| 21.59999999999882 | -0.001 | -0.001 |  |
| 21.57999999999882 | -0.001 | -0.001 |  |
| 21.55999999999882 | -0.001 | -0.001 |  |
| 21.53999999999882 | -0.001 | -0.001 |  |
| 21.51999999999882 | -0.001 | -0.001 |  |
| 21.49999999999882 | -0.001 | -0.001 |  |
| 21.47999999999882 | -0.001 | -0.001 |  |
| 21.45999999999882 | -0.001 | -0.001 |  |
| 21.43999999999882 | -0.001 | -0.001 |  |
| 21.41999999999882 | -0.001 | -0.001 |  |
| 21.39999999999882 | -0.001 | -0.001 |  |
| 21.37999999999882 | -0.001 | -0.001 |  |
| 21.35999999999882 | -0.001 | -0.001 |  |
| 21.33999999999882 | -0.001 | -0.001 |  |
| 21.31999999999882 | -0.001 | -0.001 |  |
| 21.29999999999882 | -0.001 | -0.001 |  |
| 21.27999999999883 | -0.001 | -0.001 |  |
| 21.25999999999883 | -0.001 | -0.001 |  |
| 21.23999999999883 | -0.001 | -0.001 |  |
| 21.21999999999883 | -0.001 | -0.001 |  |
| 21.19999999999883 | -0.001 | -0.001 |  |
| 21.17999999999883 | -0.001 | -0.001 |  |
| 21.15999999999883 | -0.001 | -0.001 |  |
| 21.13999999999883 | -0.001 | -0.001 |  |
| 21.11999999999883 | -0.001 | -0.001 |  |
| 21.09999999999883 | -0.001 | -0.001 |  |
| 21.07999999999883 | -0.001 | -0.001 |  |
| 21.05999999999883 | -0.001 | -0.001 |  |
| 21.03999999999883 | -0.001 | -0.001 |  |
| 21.01999999999883 | -0.001 | -0.001 |  |
| 20.99999999999883 | -0.001 | -0.001 |  |
| 20.97999999999883 | -0.001 | -0.001 |  |
| 20.95999999999883 | -0.001 | -0.001 |  |
| 20.93999999999883 | -0.001 | -0.001 |  |
| 20.91999999999883 | -0.001 | -0.001 |  |
| 20.89999999999883 | -0.001 | -0.001 |  |
| 20.87999999999883 | -0.001 | -0.001 |  |
| 20.85999999999883 | -0.001 | -0.001 |  |
| 20.83999999999883 | -0.001 | -0.001 |  |
| 20.81999999999883 | -0.001 | -0.001 |  |
| 20.79999999999884 | -0.001 | -0.001 |  |
| 20.77999999999884 | -0.001 | -0.001 |  |
| 20.75999999999884 | -0.001 | -0.001 |  |
| 20.73999999999884 | -0.001 | -0.001 |  |
| 20.71999999999884 | -0.001 | -0.001 |  |
| 20.69999999999884 | -0.001 | -0.001 |  |
| 20.67999999999884 | -0.001 | -0.001 |  |
| 20.65999999999884 | -0.001 | -0.001 |  |
| 20.63999999999884 | -0.001 | -0.001 |  |
| 20.61999999999884 | -0.001 | -0.001 |  |
| 20.59999999999884 | -0.001 | -0.001 |  |
| 20.57999999999884 | -0.001 | -0.001 |  |
| 20.55999999999884 | -0.001 | -0.001 |  |
| 20.53999999999884 | -0.001 | -0.001 |  |
| 20.51999999999884 | -0.001 | -0.001 |  |
| 20.49999999999884 | -0.001 | -0.001 |  |
| 20.47999999999884 | -0.001 | -0.001 |  |
| 20.45999999999884 | -0.001 | -0.001 |  |
| 20.43999999999884 | -0.001 | -0.001 |  |
| 20.41999999999884 | -0.001 | -0.001 |  |
| 20.39999999999884 | -0.001 | -0.001 |  |
| 20.37999999999884 | -0.001 | -0.001 |  |
| 20.35999999999884 | -0.001 | -0.001 |  |
| 20.33999999999885 | -0.001 | -0.001 |  |
| 20.31999999999885 | -0.001 | -0.001 |  |
| 20.29999999999885 | -0.001 | -0.001 |  |
| 20.27999999999885 | -0.001 | -0.001 |  |
| 20.25999999999885 | -0.001 | -0.001 |  |
| 20.23999999999885 | -0.001 | -0.001 |  |
| 20.21999999999885 | -0.001 | -0.001 |  |
| 20.19999999999885 | -0.001 | -0.001 |  |
| 20.17999999999885 | -0.001 | -0.001 |  |
| 20.15999999999885 | -0.001 | -0.001 |  |
| 20.13999999999885 | -0.001 | -0.001 |  |
| 20.11999999999885 | -0.001 | -0.001 |  |
| 20.09999999999885 | -0.001 | -0.001 |  |
| 20.07999999999885 | -0.001 | -0.001 |  |
| 20.05999999999885 | -0.001 | -0.001 |  |
| 20.03999999999885 | -0.001 | -0.001 |  |
| 20.01999999999885 | -0.001 | -0.001 |  |
| 19.99999999999885 | -0.001 | -0.001 |  |
| 19.97999999999885 | -0.001 | -0.001 |  |
| 19.95999999999885 | -0.001 | -0.001 |  |
| 19.93999999999885 | -0.001 | -0.001 |  |
| 19.91999999999885 | -0.001 | -0.001 |  |
| 19.89999999999885 | -0.001 | -0.001 |  |
| 19.87999999999885 | -0.001 | -0.001 |  |
| 19.85999999999886 | -0.001 | -0.001 |  |
| 19.83999999999886 | -0.001 | -0.001 |  |
| 19.81999999999886 | -0.001 | -0.001 |  |
| 19.79999999999886 | -0.001 | -0.001 |  |
| 19.77999999999886 | -0.001 | -0.001 |  |
| 19.75999999999886 | -0.001 | -0.001 |  |
| 19.73999999999886 | -0.001 | -0.001 |  |
| 19.71999999999886 | -0.001 | -0.001 |  |
| 19.69999999999886 | -0.001 | -0.001 |  |
| 19.67999999999886 | -0.001 | -0.001 |  |
| 19.65999999999886 | -0.001 | -0.001 |  |
| 19.63999999999886 | -0.001 | -0.001 |  |
| 19.61999999999886 | -0.001 | -0.001 |  |
| 19.59999999999886 | -0.001 | -0.001 |  |
| 19.57999999999886 | -0.001 | -0.001 |  |
| 19.55999999999886 | -0.001 | -0.001 |  |
| 19.53999999999886 | -0.001 | -0.001 |  |
| 19.51999999999886 | -0.001 | -0.001 |  |
| 19.49999999999886 | -0.001 | -0.001 |  |
| 19.47999999999886 | -0.001 | -0.001 |  |
| 19.45999999999886 | -0.001 | -0.001 |  |
| 19.43999999999886 | -0.001 | -0.001 |  |
| 19.41999999999886 | -0.001 | -0.001 |  |
| 19.39999999999887 | -0.001 | -0.001 |  |
| 19.37999999999887 | -0.001 | -0.001 |  |
| 19.35999999999887 | -0.001 | -0.001 |  |
| 19.33999999999887 | -0.001 | -0.001 |  |
| 19.31999999999887 | -0.001 | -0.001 |  |
| 19.29999999999887 | -0.001 | -0.001 |  |
| 19.27999999999887 | -0.001 | -0.001 |  |
| 19.25999999999887 | -0.001 | -0.001 |  |
| 19.23999999999887 | -0.001 | -0.001 |  |
| 19.21999999999887 | -0.001 | -0.001 |  |
| 19.19999999999887 | -0.001 | -0.001 |  |
| 19.17999999999887 | -0.001 | -0.001 |  |
| 19.15999999999887 | -0.001 | -0.001 |  |
| 19.13999999999887 | -0.001 | -0.001 |  |
| 19.11999999999887 | -0.001 | -0.001 |  |
| 19.09999999999887 | -0.001 | -0.001 |  |
| 19.07999999999887 | -0.001 | -0.001 |  |
| 19.05999999999887 | -0.001 | -0.001 |  |
| 19.03999999999887 | -0.001 | -0.001 |  |
| 19.01999999999887 | -0.001 | -0.001 |  |
| 18.99999999999887 | -0.001 | -0.001 |  |
| 18.97999999999887 | -0.001 | -0.001 |  |
| 18.95999999999887 | -0.001 | -0.001 |  |
| 18.93999999999888 | -0.001 | -0.001 |  |
| 18.91999999999888 | -0.001 | -0.001 |  |
| 18.89999999999888 | -0.001 | -0.001 |  |
| 18.87999999999888 | -0.001 | -0.001 |  |
| 18.85999999999888 | -0.001 | -0.001 |  |
| 18.83999999999888 | -0.001 | -0.001 |  |
| 18.81999999999888 | -0.001 | -0.001 |  |
| 18.79999999999888 | -0.001 | -0.001 |  |
| 18.77999999999888 | -0.001 | -0.001 |  |
| 18.75999999999888 | -0.001 | -0.001 |  |
| 18.73999999999888 | -0.001 | -0.001 |  |
| 18.71999999999888 | -0.001 | -0.001 |  |
| 18.69999999999888 | -0.001 | -0.001 |  |
| 18.67999999999888 | -0.001 | -0.001 |  |
| 18.65999999999888 | -0.001 | -0.001 |  |
| 18.63999999999888 | -0.001 | -0.001 |  |
| 18.61999999999888 | -0.001 | -0.001 |  |
| 18.59999999999888 | -0.001 | -0.001 |  |
| 18.57999999999888 | -0.001 | -0.001 |  |
| 18.55999999999888 | -0.001 | -0.001 |  |
| 18.53999999999888 | -0.001 | -0.001 |  |
| 18.51999999999888 | -0.001 | -0.001 |  |
| 18.49999999999888 | -0.001 | -0.001 |  |
| 18.47999999999888 | -0.001 | -0.001 |  |
| 18.45999999999889 | -0.001 | -0.001 |  |
| 18.43999999999889 | -0.001 | -0.001 |  |
| 18.41999999999889 | -0.001 | -0.001 |  |
| 18.39999999999889 | -0.001 | -0.001 |  |
| 18.37999999999889 | -0.001 | -0.001 |  |
| 18.35999999999889 | -0.001 | -0.001 |  |
| 18.33999999999889 | -0.001 | -0.001 |  |
| 18.31999999999889 | -0.001 | -0.001 |  |
| 18.29999999999889 | -0.001 | -0.001 |  |
| 18.27999999999889 | -0.001 | -0.001 |  |
| 18.25999999999889 | -0.001 | -0.001 |  |
| 18.23999999999889 | -0.002 | -0.001 |  |
| 18.2199999999989 | -0.002 | -0.001 |  |
| 18.1999999999989 | -0.002 | -0.001 |  |
| 18.1799999999989 | -0.002 | -0.001 |  |
| 18.1599999999989 | -0.002 | -0.001 |  |
| 18.1399999999989 | -0.002 | -0.001 |  |
| 18.1199999999989 | -0.002 | -0.001 |  |
| 18.09999999999889 | -0.002 | -0.001 |  |
| 18.07999999999889 | -0.002 | -0.001 |  |
| 18.05999999999889 | -0.002 | -0.001 |  |
| 18.03999999999889 | -0.002 | -0.001 |  |
| 18.01999999999889 | -0.002 | -0.001 |  |
| 17.9999999999989 | -0.002 | -0.001 |  |
| 17.9799999999989 | -0.002 | -0.001 |  |
| 17.9599999999989 | -0.002 | -0.001 |  |
| 17.9399999999989 | -0.002 | -0.001 |  |
| 17.9199999999989 | -0.002 | -0.001 |  |
| 17.8999999999989 | -0.002 | -0.001 |  |
| 17.8799999999989 | -0.002 | -0.001 |  |
| 17.8599999999989 | -0.002 | -0.001 |  |
| 17.8399999999989 | -0.002 | -0.001 |  |
| 17.8199999999989 | -0.002 | -0.001 |  |
| 17.7999999999989 | -0.002 | -0.001 |  |
| 17.7799999999989 | -0.002 | -0.001 |  |
| 17.7599999999989 | -0.002 | -0.001 |  |
| 17.7399999999989 | -0.002 | -0.001 |  |
| 17.7199999999989 | -0.002 | -0.001 |  |
| 17.6999999999989 | -0.002 | -0.001 |  |
| 17.6799999999989 | -0.002 | -0.001 |  |
| 17.6599999999989 | -0.002 | -0.001 |  |
| 17.6399999999989 | -0.002 | -0.001 |  |
| 17.6199999999989 | -0.002 | -0.001 |  |
| 17.5999999999989 | -0.002 | -0.001 |  |
| 17.5799999999989 | -0.002 | -0.001 |  |
| 17.5599999999989 | -0.002 | -0.001 |  |
| 17.5399999999989 | -0.002 | -0.001 |  |
| 17.51999999999891 | -0.002 | -0.001 |  |
| 17.49999999999891 | -0.002 | -0.001 |  |
| 17.47999999999891 | -0.002 | -0.001 |  |
| 17.45999999999891 | -0.002 | -0.001 |  |
| 17.43999999999891 | -0.002 | -0.001 |  |
| 17.41999999999891 | -0.002 | -0.001 |  |
| 17.39999999999891 | -0.002 | -0.001 |  |
| 17.37999999999891 | -0.002 | -0.001 |  |
| 17.35999999999891 | -0.002 | -0.001 |  |
| 17.33999999999891 | -0.002 | -0.001 |  |
| 17.31999999999891 | -0.002 | -0.001 |  |
| 17.29999999999891 | -0.002 | -0.001 |  |
| 17.27999999999891 | -0.002 | -0.001 |  |
| 17.25999999999891 | -0.002 | -0.001 |  |
| 17.23999999999891 | -0.002 | -0.001 |  |
| 17.21999999999891 | -0.002 | -0.001 |  |
| 17.19999999999891 | -0.002 | -0.001 |  |
| 17.17999999999891 | -0.002 | -0.001 |  |
| 17.15999999999891 | -0.002 | -0.001 |  |
| 17.13999999999891 | -0.002 | -0.001 |  |
| 17.11999999999891 | -0.002 | -0.001 |  |
| 17.09999999999891 | -0.002 | -0.001 |  |
| 17.07999999999891 | -0.002 | -0.001 |  |
| 17.05999999999892 | -0.002 | -0.001 |  |
| 17.03999999999892 | -0.002 | -0.001 |  |
| 17.01999999999892 | -0.002 | -0.001 |  |
| 16.99999999999892 | -0.002 | -0.001 |  |
| 16.97999999999892 | -0.002 | -0.001 |  |
| 16.95999999999892 | -0.002 | -0.001 |  |
| 16.93999999999892 | -0.002 | -0.001 |  |
| 16.91999999999892 | -0.002 | -0.001 |  |
| 16.89999999999892 | -0.002 | -0.001 |  |
| 16.87999999999892 | -0.002 | -0.001 |  |
| 16.85999999999892 | -0.002 | -0.001 |  |
| 16.83999999999892 | -0.002 | -0.001 |  |
| 16.81999999999892 | -0.002 | -0.001 |  |
| 16.79999999999892 | -0.002 | -0.001 |  |
| 16.77999999999892 | -0.002 | -0.001 |  |
| 16.75999999999892 | -0.002 | -0.001 |  |
| 16.73999999999892 | -0.002 | -0.001 |  |
| 16.71999999999892 | -0.002 | -0.001 |  |
| 16.69999999999892 | -0.002 | -0.001 |  |
| 16.67999999999892 | -0.002 | -0.001 |  |
| 16.65999999999892 | -0.002 | -0.001 |  |
| 16.63999999999892 | -0.002 | -0.001 |  |
| 16.61999999999892 | -0.002 | -0.001 |  |
| 16.59999999999892 | -0.002 | -0.001 |  |
| 16.57999999999893 | -0.002 | -0.001 |  |
| 16.55999999999893 | -0.002 | -0.001 |  |
| 16.53999999999893 | -0.002 | -0.001 |  |
| 16.51999999999893 | -0.002 | -0.001 |  |
| 16.49999999999893 | -0.002 | -0.001 |  |
| 16.47999999999893 | -0.002 | -0.001 |  |
| 16.45999999999893 | -0.002 | -0.001 |  |
| 16.43999999999893 | -0.002 | -0.001 |  |
| 16.41999999999893 | -0.002 | -0.001 |  |
| 16.39999999999893 | -0.002 | -0.001 |  |
| 16.37999999999893 | -0.002 | -0.001 |  |
| 16.35999999999893 | -0.002 | -0.001 |  |
| 16.33999999999893 | -0.002 | -0.001 |  |
| 16.31999999999893 | -0.002 | -0.001 |  |
| 16.29999999999893 | -0.002 | -0.001 |  |
| 16.27999999999893 | -0.002 | -0.001 |  |
| 16.25999999999893 | -0.002 | -0.001 |  |
| 16.23999999999893 | -0.002 | -0.001 |  |
| 16.21999999999893 | -0.002 | -0.001 |  |
| 16.19999999999893 | -0.002 | -0.001 |  |
| 16.17999999999893 | -0.002 | -0.001 |  |
| 16.15999999999893 | -0.002 | -0.001 |  |
| 16.13999999999893 | -0.002 | -0.001 |  |
| 16.11999999999894 | -0.002 | -0.001 |  |
| 16.09999999999894 | -0.002 | -0.001 |  |
| 16.07999999999894 | -0.002 | -0.001 |  |
| 16.05999999999894 | -0.002 | -0.001 |  |
| 16.03999999999894 | -0.002 | -0.001 |  |
| 16.01999999999894 | -0.002 | -0.001 |  |
| 15.99999999999894 | -0.002 | -0.001 |  |
| 15.97999999999894 | -0.002 | -0.001 |  |
| 15.95999999999894 | -0.002 | -0.001 |  |
| 15.93999999999894 | -0.002 | -0.001 |  |
| 15.91999999999894 | -0.002 | -0.002 |  |
| 15.89999999999894 | -0.002 | -0.002 |  |
| 15.87999999999894 | -0.002 | -0.002 |  |
| 15.85999999999894 | -0.002 | -0.002 |  |
| 15.83999999999894 | -0.002 | -0.002 |  |
| 15.81999999999894 | -0.002 | -0.002 |  |
| 15.79999999999894 | -0.002 | -0.002 |  |
| 15.77999999999894 | -0.002 | -0.002 |  |
| 15.75999999999894 | -0.002 | -0.002 |  |
| 15.73999999999894 | -0.002 | -0.002 |  |
| 15.71999999999894 | -0.002 | -0.002 |  |
| 15.69999999999894 | -0.002 | -0.002 |  |
| 15.67999999999894 | -0.002 | -0.002 |  |
| 15.65999999999894 | -0.002 | -0.002 |  |
| 15.63999999999895 | -0.002 | -0.002 |  |
| 15.61999999999895 | -0.002 | -0.002 |  |
| 15.59999999999895 | -0.002 | -0.002 |  |
| 15.57999999999895 | -0.002 | -0.002 |  |
| 15.55999999999895 | -0.002 | -0.002 |  |
| 15.53999999999895 | -0.002 | -0.002 |  |
| 15.51999999999895 | -0.002 | -0.002 |  |
| 15.49999999999895 | -0.002 | -0.002 |  |
| 15.47999999999895 | -0.002 | -0.002 |  |
| 15.45999999999895 | -0.002 | -0.002 |  |
| 15.43999999999895 | -0.002 | -0.002 |  |
| 15.41999999999895 | -0.002 | -0.002 |  |
| 15.39999999999895 | -0.002 | -0.002 |  |
| 15.37999999999895 | -0.002 | -0.002 |  |
| 15.35999999999895 | -0.002 | -0.002 |  |
| 15.33999999999895 | -0.002 | -0.002 |  |
| 15.31999999999895 | -0.002 | -0.002 |  |
| 15.29999999999895 | -0.002 | -0.002 |  |
| 15.27999999999895 | -0.002 | -0.002 |  |
| 15.25999999999895 | -0.002 | -0.002 |  |
| 15.23999999999895 | -0.002 | -0.002 |  |
| 15.21999999999895 | -0.002 | -0.002 |  |
| 15.19999999999895 | -0.002 | -0.002 |  |
| 15.17999999999896 | -0.002 | -0.002 |  |
| 15.15999999999896 | -0.002 | -0.002 |  |
| 15.13999999999896 | -0.002 | -0.002 |  |
| 15.11999999999896 | -0.002 | -0.002 |  |
| 15.09999999999896 | -0.002 | -0.002 |  |
| 15.07999999999896 | -0.002 | -0.002 |  |
| 15.05999999999896 | -0.002 | -0.002 |  |
| 15.03999999999896 | -0.002 | -0.002 |  |
| 15.01999999999896 | -0.002 | -0.002 |  |
| 14.99999999999896 | -0.002 | -0.002 |  |
| 14.97999999999896 | -0.002 | -0.002 |  |
| 14.95999999999896 | -0.002 | -0.002 |  |
| 14.93999999999896 | -0.002 | -0.002 |  |
| 14.91999999999896 | -0.002 | -0.002 |  |
| 14.89999999999896 | -0.002 | -0.002 |  |
| 14.87999999999896 | -0.002 | -0.002 |  |
| 14.85999999999896 | -0.002 | -0.002 |  |
| 14.83999999999896 | -0.002 | -0.002 |  |
| 14.81999999999896 | -0.002 | -0.002 |  |
| 14.79999999999896 | -0.002 | -0.002 |  |
| 14.77999999999896 | -0.002 | -0.002 |  |
| 14.75999999999896 | -0.002 | -0.002 |  |
| 14.73999999999896 | -0.002 | -0.002 |  |
| 14.71999999999896 | -0.002 | -0.002 |  |
| 14.69999999999897 | -0.002 | -0.002 |  |
| 14.67999999999897 | -0.002 | -0.002 |  |
| 14.65999999999897 | -0.002 | -0.002 |  |
| 14.63999999999897 | -0.002 | -0.002 |  |
| 14.61999999999897 | -0.002 | -0.002 |  |
| 14.59999999999897 | -0.002 | -0.002 |  |
| 14.57999999999897 | -0.002 | -0.002 |  |
| 14.55999999999897 | -0.002 | -0.002 |  |
| 14.53999999999897 | -0.002 | -0.002 |  |
| 14.51999999999897 | -0.002 | -0.002 |  |
| 14.49999999999897 | -0.002 | -0.002 |  |
| 14.47999999999897 | -0.002 | -0.002 |  |
| 14.45999999999897 | -0.002 | -0.002 |  |
| 14.43999999999897 | -0.002 | -0.002 |  |
| 14.41999999999897 | -0.002 | -0.002 |  |
| 14.39999999999897 | -0.002 | -0.002 |  |
| 14.37999999999897 | -0.002 | -0.002 |  |
| 14.35999999999897 | -0.002 | -0.002 |  |
| 14.33999999999897 | -0.002 | -0.002 |  |
| 14.31999999999897 | -0.002 | -0.002 |  |
| 14.29999999999897 | -0.002 | -0.002 |  |
| 14.27999999999897 | -0.002 | -0.002 |  |
| 14.25999999999897 | -0.002 | -0.002 |  |
| 14.23999999999898 | -0.002 | -0.002 |  |
| 14.21999999999898 | -0.002 | -0.002 |  |
| 14.19999999999898 | -0.002 | -0.002 |  |
| 14.17999999999898 | -0.002 | -0.002 |  |
| 14.15999999999898 | -0.002 | -0.002 |  |
| 14.13999999999898 | -0.003 | -0.002 |  |
| 14.11999999999898 | -0.003 | -0.002 |  |
| 14.09999999999898 | -0.003 | -0.002 |  |
| 14.07999999999898 | -0.003 | -0.002 |  |
| 14.05999999999898 | -0.003 | -0.002 |  |
| 14.03999999999898 | -0.003 | -0.002 |  |
| 14.01999999999898 | -0.003 | -0.002 |  |
| 13.99999999999898 | -0.003 | -0.002 |  |
| 13.97999999999898 | -0.003 | -0.002 |  |
| 13.95999999999898 | -0.003 | -0.002 |  |
| 13.93999999999898 | -0.003 | -0.002 |  |
| 13.91999999999898 | -0.003 | -0.002 |  |
| 13.89999999999898 | -0.003 | -0.002 |  |
| 13.87999999999898 | -0.003 | -0.002 |  |
| 13.85999999999898 | -0.003 | -0.002 |  |
| 13.83999999999898 | -0.003 | -0.002 |  |
| 13.81999999999898 | -0.003 | -0.002 |  |
| 13.79999999999898 | -0.003 | -0.002 |  |
| 13.77999999999898 | -0.003 | -0.002 |  |
| 13.75999999999899 | -0.003 | -0.002 |  |
| 13.73999999999899 | -0.003 | -0.002 |  |
| 13.71999999999899 | -0.003 | -0.002 |  |
| 13.69999999999899 | -0.003 | -0.002 |  |
| 13.67999999999899 | -0.003 | -0.002 |  |
| 13.65999999999899 | -0.003 | -0.002 |  |
| 13.63999999999899 | -0.003 | -0.002 |  |
| 13.61999999999899 | -0.003 | -0.002 |  |
| 13.59999999999899 | -0.003 | -0.002 |  |
| 13.57999999999899 | -0.003 | -0.002 |  |
| 13.55999999999899 | -0.003 | -0.002 |  |
| 13.539999999999 | -0.003 | -0.002 |  |
| 13.519999999999 | -0.003 | -0.002 |  |
| 13.499999999999 | -0.003 | -0.002 |  |
| 13.479999999999 | -0.003 | -0.002 |  |
| 13.459999999999 | -0.003 | -0.002 |  |
| 13.439999999999 | -0.003 | -0.002 |  |
| 13.419999999999 | -0.003 | -0.002 |  |
| 13.399999999999 | -0.003 | -0.002 |  |
| 13.379999999999 | -0.003 | -0.002 |  |
| 13.359999999999 | -0.003 | -0.002 |  |
| 13.33999999999899 | -0.003 | -0.002 |  |
| 13.31999999999899 | -0.003 | -0.002 |  |
| 13.299999999999 | -0.003 | -0.002 |  |
| 13.279999999999 | -0.003 | -0.002 |  |
| 13.259999999999 | -0.003 | -0.002 |  |
| 13.239999999999 | -0.003 | -0.002 |  |
| 13.219999999999 | -0.003 | -0.002 |  |
| 13.199999999999 | -0.003 | -0.002 |  |
| 13.179999999999 | -0.003 | -0.002 |  |
| 13.159999999999 | -0.003 | -0.002 |  |
| 13.139999999999 | -0.003 | -0.002 |  |
| 13.119999999999 | -0.003 | -0.002 |  |
| 13.099999999999 | -0.003 | -0.002 |  |
| 13.079999999999 | -0.003 | -0.002 |  |
| 13.059999999999 | -0.003 | -0.002 |  |
| 13.039999999999 | -0.003 | -0.002 |  |
| 13.019999999999 | -0.003 | -0.002 |  |
| 12.999999999999 | -0.003 | -0.002 |  |
| 12.979999999999 | -0.003 | -0.002 |  |
| 12.959999999999 | -0.003 | -0.002 |  |
| 12.939999999999 | -0.003 | -0.002 |  |
| 12.919999999999 | -0.003 | -0.002 |  |
| 12.899999999999 | -0.003 | -0.002 |  |
| 12.879999999999 | -0.003 | -0.002 |  |
| 12.859999999999 | -0.003 | -0.002 |  |
| 12.83999999999901 | -0.003 | -0.002 |  |
| 12.81999999999901 | -0.003 | -0.002 |  |
| 12.79999999999901 | -0.003 | -0.002 |  |
| 12.77999999999901 | -0.003 | -0.002 |  |
| 12.75999999999901 | -0.003 | -0.002 |  |
| 12.73999999999901 | -0.003 | -0.002 |  |
| 12.71999999999901 | -0.003 | -0.002 |  |
| 12.69999999999901 | -0.003 | -0.002 |  |
| 12.67999999999901 | -0.003 | -0.002 |  |
| 12.65999999999901 | -0.003 | -0.002 |  |
| 12.63999999999901 | -0.003 | -0.002 |  |
| 12.61999999999901 | -0.003 | -0.002 |  |
| 12.59999999999901 | -0.003 | -0.002 |  |
| 12.57999999999901 | -0.003 | -0.002 |  |
| 12.55999999999901 | -0.003 | -0.002 |  |
| 12.53999999999901 | -0.003 | -0.002 |  |
| 12.51999999999901 | -0.003 | -0.002 |  |
| 12.49999999999901 | -0.003 | -0.002 |  |
| 12.47999999999901 | -0.003 | -0.002 |  |
| 12.45999999999901 | -0.003 | -0.002 |  |
| 12.43999999999901 | -0.003 | -0.002 |  |
| 12.41999999999901 | -0.003 | -0.002 |  |
| 12.39999999999901 | -0.003 | -0.002 |  |
| 12.37999999999901 | -0.003 | -0.002 |  |
| 12.35999999999902 | -0.003 | -0.002 |  |
| 12.33999999999902 | -0.003 | -0.002 |  |
| 12.31999999999902 | -0.003 | -0.002 |  |
| 12.29999999999902 | -0.003 | -0.002 |  |
| 12.27999999999902 | -0.003 | -0.002 |  |
| 12.25999999999902 | -0.003 | -0.002 |  |
| 12.23999999999902 | -0.003 | -0.002 |  |
| 12.21999999999902 | -0.003 | -0.002 |  |
| 12.19999999999902 | -0.003 | -0.002 |  |
| 12.17999999999902 | -0.003 | -0.002 |  |
| 12.15999999999902 | -0.003 | -0.002 |  |
| 12.13999999999902 | -0.003 | -0.002 |  |
| 12.11999999999902 | -0.003 | -0.002 |  |
| 12.09999999999902 | -0.003 | -0.002 |  |
| 12.07999999999902 | -0.003 | -0.002 |  |
| 12.05999999999902 | -0.003 | -0.002 |  |
| 12.03999999999902 | -0.003 | -0.002 |  |
| 12.01999999999902 | -0.003 | -0.002 |  |
| 11.99999999999902 | -0.003 | -0.002 |  |
| 11.97999999999902 | -0.003 | -0.002 |  |
| 11.95999999999902 | -0.003 | -0.002 |  |
| 11.93999999999902 | -0.004 | -0.002 |  |
| 11.91999999999902 | -0.004 | -0.002 |  |
| 11.89999999999903 | -0.004 | -0.002 |  |
| 11.87999999999903 | -0.004 | -0.002 |  |
| 11.85999999999903 | -0.004 | -0.002 |  |
| 11.83999999999903 | -0.004 | -0.002 |  |
| 11.81999999999903 | -0.004 | -0.002 |  |
| 11.79999999999903 | -0.004 | -0.002 |  |
| 11.77999999999903 | -0.004 | -0.002 |  |
| 11.75999999999903 | -0.004 | -0.002 |  |
| 11.73999999999903 | -0.004 | -0.002 |  |
| 11.71999999999903 | -0.004 | -0.002 |  |
| 11.69999999999903 | -0.004 | -0.002 |  |
| 11.67999999999903 | -0.004 | -0.002 |  |
| 11.65999999999903 | -0.004 | -0.002 |  |
| 11.63999999999903 | -0.004 | -0.003 |  |
| 11.61999999999903 | -0.004 | -0.003 |  |
| 11.59999999999903 | -0.004 | -0.003 |  |
| 11.57999999999903 | -0.004 | -0.003 |  |
| 11.55999999999903 | -0.004 | -0.003 |  |
| 11.53999999999903 | -0.004 | -0.003 |  |
| 11.51999999999903 | -0.004 | -0.003 |  |
| 11.49999999999903 | -0.004 | -0.003 |  |
| 11.47999999999903 | -0.004 | -0.003 |  |
| 11.45999999999903 | -0.004 | -0.003 |  |
| 11.43999999999903 | -0.004 | -0.003 |  |
| 11.41999999999904 | -0.004 | -0.003 |  |
| 11.39999999999904 | -0.004 | -0.003 |  |
| 11.37999999999904 | -0.004 | -0.003 |  |
| 11.35999999999904 | -0.004 | -0.003 |  |
| 11.33999999999904 | -0.004 | -0.003 |  |
| 11.31999999999904 | -0.004 | -0.003 |  |
| 11.29999999999904 | -0.004 | -0.003 |  |
| 11.27999999999904 | -0.004 | -0.003 |  |
| 11.25999999999904 | -0.004 | -0.003 |  |
| 11.23999999999904 | -0.004 | -0.003 |  |
| 11.21999999999904 | -0.004 | -0.003 |  |
| 11.19999999999904 | -0.004 | -0.003 |  |
| 11.17999999999904 | -0.004 | -0.003 |  |
| 11.15999999999904 | -0.004 | -0.003 |  |
| 11.13999999999904 | -0.004 | -0.003 |  |
| 11.11999999999904 | -0.004 | -0.003 |  |
| 11.09999999999904 | -0.004 | -0.003 |  |
| 11.07999999999904 | -0.004 | -0.003 |  |
| 11.05999999999904 | -0.004 | -0.003 |  |
| 11.03999999999904 | -0.004 | -0.003 |  |
| 11.01999999999904 | -0.004 | -0.003 |  |
| 10.99999999999904 | -0.004 | -0.003 |  |
| 10.97999999999904 | -0.004 | -0.003 |  |
| 10.95999999999905 | -0.004 | -0.003 |  |
| 10.93999999999905 | -0.004 | -0.003 |  |
| 10.91999999999905 | -0.004 | -0.003 |  |
| 10.89999999999905 | -0.004 | -0.003 |  |
| 10.87999999999905 | -0.004 | -0.003 |  |
| 10.85999999999905 | -0.004 | -0.003 |  |
| 10.83999999999905 | -0.004 | -0.003 |  |
| 10.81999999999905 | -0.004 | -0.003 |  |
| 10.79999999999905 | -0.004 | -0.003 |  |
| 10.77999999999905 | -0.004 | -0.003 |  |
| 10.75999999999905 | -0.004 | -0.003 |  |
| 10.73999999999905 | -0.004 | -0.003 |  |
| 10.71999999999905 | -0.004 | -0.003 |  |
| 10.69999999999905 | -0.004 | -0.003 |  |
| 10.67999999999905 | -0.004 | -0.003 |  |
| 10.65999999999905 | -0.004 | -0.003 |  |
| 10.63999999999905 | -0.004 | -0.003 |  |
| 10.61999999999905 | -0.004 | -0.003 |  |
| 10.59999999999905 | -0.004 | -0.003 |  |
| 10.57999999999905 | -0.004 | -0.003 |  |
| 10.55999999999905 | -0.004 | -0.003 |  |
| 10.53999999999905 | -0.005 | -0.003 |  |
| 10.51999999999905 | -0.005 | -0.003 |  |
| 10.49999999999905 | -0.005 | -0.003 |  |
| 10.47999999999906 | -0.005 | -0.003 |  |
| 10.45999999999906 | -0.005 | -0.003 |  |
| 10.43999999999906 | -0.005 | -0.003 |  |
| 10.41999999999906 | -0.005 | -0.003 |  |
| 10.39999999999906 | -0.005 | -0.003 |  |
| 10.37999999999906 | -0.005 | -0.003 |  |
| 10.35999999999906 | -0.005 | -0.003 |  |
| 10.33999999999906 | -0.005 | -0.003 |  |
| 10.31999999999906 | -0.005 | -0.003 |  |
| 10.29999999999906 | -0.005 | -0.003 |  |
| 10.27999999999906 | -0.005 | -0.003 |  |
| 10.25999999999906 | -0.005 | -0.003 |  |
| 10.23999999999906 | -0.005 | -0.003 |  |
| 10.21999999999906 | -0.005 | -0.003 |  |
| 10.19999999999906 | -0.005 | -0.003 |  |
| 10.17999999999906 | -0.005 | -0.003 |  |
| 10.15999999999906 | -0.005 | -0.003 |  |
| 10.13999999999906 | -0.005 | -0.003 |  |
| 10.11999999999906 | -0.005 | -0.003 |  |
| 10.09999999999906 | -0.005 | -0.003 |  |
| 10.07999999999906 | -0.005 | -0.003 |  |
| 10.05999999999906 | -0.005 | -0.003 |  |
| 10.03999999999906 | -0.005 | -0.003 |  |
| 10.01999999999907 | -0.005 | -0.003 |  |
| 9.999999999999066 | -0.005 | -0.003 |  |
| 9.979999999999066 | -0.005 | -0.003 |  |
| 9.959999999999066 | -0.005 | -0.003 |  |
| 9.939999999999065 | -0.005 | -0.003 |  |
| 9.919999999999067 | -0.005 | -0.003 |  |
| 9.899999999999068 | -0.005 | -0.003 |  |
| 9.879999999999068 | -0.005 | -0.003 |  |
| 9.859999999999069 | -0.005 | -0.003 |  |
| 9.839999999999067 | -0.005 | -0.003 |  |
| 9.81999999999907 | -0.005 | -0.003 |  |
| 9.79999999999907 | -0.005 | -0.003 |  |
| 9.77999999999907 | -0.005 | -0.003 |  |
| 9.75999999999907 | -0.005 | -0.003 |  |
| 9.739999999999071 | -0.005 | -0.003 |  |
| 9.719999999999072 | -0.005 | -0.003 |  |
| 9.69999999999907 | -0.005 | -0.003 |  |
| 9.679999999999072 | -0.005 | -0.003 |  |
| 9.659999999999073 | -0.005 | -0.003 |  |
| 9.639999999999073 | -0.005 | -0.003 |  |
| 9.619999999999074 | -0.005 | -0.003 |  |
| 9.599999999999074 | -0.005 | -0.003 |  |
| 9.579999999999075 | -0.005 | -0.003 |  |
| 9.559999999999075 | -0.005 | -0.003 |  |
| 9.539999999999075 | -0.005 | -0.003 |  |
| 9.519999999999076 | -0.006 | -0.003 |  |
| 9.499999999999076 | -0.006 | -0.003 |  |
| 9.479999999999077 | -0.006 | -0.003 |  |
| 9.459999999999077 | -0.006 | -0.003 |  |
| 9.439999999999078 | -0.006 | -0.003 |  |
| 9.419999999999076 | -0.006 | -0.003 |  |
| 9.399999999999078 | -0.006 | -0.003 |  |
| 9.379999999999079 | -0.006 | -0.003 |  |
| 9.35999999999908 | -0.006 | -0.003 |  |
| 9.33999999999908 | -0.006 | -0.003 |  |
| 9.31999999999908 | -0.006 | -0.003 |  |
| 9.29999999999908 | -0.006 | -0.003 |  |
| 9.27999999999908 | -0.006 | -0.004 |  |
| 9.25999999999908 | -0.006 | -0.004 |  |
| 9.239999999999082 | -0.006 | -0.004 |  |
| 9.219999999999082 | -0.006 | -0.004 |  |
| 9.199999999999083 | -0.006 | -0.004 |  |
| 9.179999999999083 | -0.006 | -0.004 |  |
| 9.159999999999084 | -0.006 | -0.004 |  |
| 9.139999999999082 | -0.006 | -0.004 |  |
| 9.119999999999084 | -0.006 | -0.004 |  |
| 9.099999999999085 | -0.006 | -0.004 |  |
| 9.079999999999085 | -0.006 | -0.004 |  |
| 9.059999999999086 | -0.006 | -0.004 |  |
| 9.039999999999086 | -0.006 | -0.004 |  |
| 9.019999999999087 | -0.006 | -0.004 |  |
| 8.999999999999085 | -0.006 | -0.004 |  |
| 8.979999999999087 | -0.006 | -0.004 |  |
| 8.959999999999088 | -0.006 | -0.004 |  |
| 8.939999999999088 | -0.006 | -0.004 |  |
| 8.919999999999089 | -0.006 | -0.004 |  |
| 8.89999999999909 | -0.006 | -0.004 |  |
| 8.87999999999909 | -0.006 | -0.004 |  |
| 8.85999999999909 | -0.006 | -0.004 |  |
| 8.83999999999909 | -0.006 | -0.004 |  |
| 8.81999999999909 | -0.006 | -0.004 |  |
| 8.79999999999909 | -0.006 | -0.004 |  |
| 8.77999999999909 | -0.006 | -0.004 |  |
| 8.75999999999909 | -0.007 | -0.004 |  |
| 8.739999999999092 | -0.007 | -0.004 |  |
| 8.719999999999091 | -0.007 | -0.004 |  |
| 8.699999999999093 | -0.007 | -0.004 |  |
| 8.679999999999094 | -0.007 | -0.004 |  |
| 8.659999999999094 | -0.007 | -0.004 |  |
| 8.639999999999095 | -0.007 | -0.004 |  |
| 8.619999999999093 | -0.007 | -0.004 |  |
| 8.599999999999095 | -0.007 | -0.004 |  |
| 8.579999999999094 | -0.007 | -0.004 |  |
| 8.559999999999096 | -0.007 | -0.004 |  |
| 8.539999999999097 | -0.007 | -0.004 |  |
| 8.519999999999097 | -0.007 | -0.004 |  |
| 8.499999999999098 | -0.007 | -0.004 |  |
| 8.479999999999098 | -0.007 | -0.004 |  |
| 8.459999999999098 | -0.007 | -0.004 |  |
| 8.439999999999097 | -0.007 | -0.004 |  |
| 8.4199999999991 | -0.007 | -0.004 |  |
| 8.3999999999991 | -0.007 | -0.004 |  |
| 8.3799999999991 | -0.007 | -0.004 |  |
| 8.3599999999991 | -0.007 | -0.004 |  |
| 8.3399999999991 | -0.007 | -0.004 |  |
| 8.3199999999991 | -0.007 | -0.004 |  |
| 8.299999999999102 | -0.007 | -0.004 |  |
| 8.279999999999102 | -0.007 | -0.004 |  |
| 8.259999999999103 | -0.007 | -0.004 |  |
| 8.239999999999103 | -0.007 | -0.004 |  |
| 8.219999999999104 | -0.007 | -0.004 |  |
| 8.199999999999102 | -0.007 | -0.004 |  |
| 8.179999999999104 | -0.007 | -0.004 |  |
| 8.159999999999105 | -0.008 | -0.004 |  |
| 8.139999999999105 | -0.008 | -0.004 |  |
| 8.119999999999106 | -0.008 | -0.004 |  |
| 8.099999999999106 | -0.008 | -0.004 |  |
| 8.079999999999107 | -0.008 | -0.004 |  |
| 8.059999999999105 | -0.008 | -0.004 |  |
| 8.039999999999107 | -0.008 | -0.004 |  |
| 8.019999999999108 | -0.008 | -0.004 |  |
| 7.999999999999108 | -0.008 | -0.004 |  |
| 7.979999999999108 | -0.008 | -0.004 |  |
| 7.95999999999911 | -0.008 | -0.004 |  |
| 7.93999999999911 | -0.008 | -0.004 |  |
| 7.91999999999911 | -0.008 | -0.004 |  |
| 7.89999999999911 | -0.008 | -0.004 |  |
| 7.87999999999911 | -0.008 | -0.004 |  |
| 7.859999999999111 | -0.008 | -0.004 |  |
| 7.839999999999111 | -0.008 | -0.004 |  |
| 7.819999999999112 | -0.008 | -0.004 |  |
| 7.799999999999112 | -0.008 | -0.004 |  |
| 7.779999999999112 | -0.008 | -0.004 |  |
| 7.759999999999113 | -0.008 | -0.004 |  |
| 7.739999999999113 | -0.008 | -0.004 |  |
| 7.719999999999114 | -0.008 | -0.004 |  |
| 7.699999999999114 | -0.008 | -0.004 |  |
| 7.679999999999114 | -0.008 | -0.004 |  |
| 7.659999999999115 | -0.009 | -0.005 |  |
| 7.639999999999115 | -0.009 | -0.005 |  |
| 7.619999999999116 | -0.009 | -0.005 |  |
| 7.599999999999116 | -0.009 | -0.005 |  |
| 7.579999999999117 | -0.009 | -0.005 |  |
| 7.559999999999117 | -0.009 | -0.005 |  |
| 7.539999999999118 | -0.009 | -0.005 |  |
| 7.519999999999118 | -0.009 | -0.005 |  |
| 7.499999999999118 | -0.009 | -0.005 |  |
| 7.47999999999912 | -0.009 | -0.005 |  |
| 7.45999999999912 | -0.009 | -0.005 |  |
| 7.43999999999912 | -0.009 | -0.005 |  |
| 7.41999999999912 | -0.009 | -0.005 |  |
| 7.39999999999912 | -0.009 | -0.005 |  |
| 7.37999999999912 | -0.009 | -0.005 |  |
| 7.359999999999121 | -0.009 | -0.005 |  |
| 7.339999999999122 | -0.009 | -0.005 |  |
| 7.319999999999122 | -0.009 | -0.005 |  |
| 7.299999999999123 | -0.009 | -0.005 |  |
| 7.279999999999123 | -0.009 | -0.005 |  |
| 7.259999999999124 | -0.009 | -0.005 |  |
| 7.239999999999124 | -0.01 | -0.005 |  |
| 7.219999999999124 | -0.01 | -0.005 |  |
| 7.199999999999125 | -0.01 | -0.005 |  |
| 7.179999999999125 | -0.01 | -0.005 |  |
| 7.159999999999126 | -0.01 | -0.005 |  |
| 7.139999999999126 | -0.01 | -0.005 |  |
| 7.119999999999127 | -0.01 | -0.005 |  |
| 7.099999999999127 | -0.01 | -0.005 |  |
| 7.079999999999127 | -0.01 | -0.005 |  |
| 7.059999999999128 | -0.01 | -0.005 |  |
| 7.039999999999128 | -0.01 | -0.005 |  |
| 7.01999999999913 | -0.01 | -0.005 |  |
| 6.99999999999913 | -0.01 | -0.005 |  |
| 6.97999999999913 | -0.01 | -0.005 |  |
| 6.95999999999913 | -0.01 | -0.005 |  |
| 6.93999999999913 | -0.01 | -0.005 |  |
| 6.91999999999913 | -0.01 | -0.005 |  |
| 6.899999999999131 | -0.011 | -0.005 |  |
| 6.879999999999132 | -0.011 | -0.005 |  |
| 6.859999999999132 | -0.011 | -0.005 |  |
| 6.839999999999132 | -0.011 | -0.005 |  |
| 6.819999999999133 | -0.011 | -0.005 |  |
| 6.799999999999133 | -0.011 | -0.005 |  |
| 6.779999999999134 | -0.011 | -0.005 |  |
| 6.759999999999134 | -0.011 | -0.005 |  |
| 6.739999999999135 | -0.011 | -0.005 |  |
| 6.719999999999135 | -0.011 | -0.005 |  |
| 6.699999999999135 | -0.011 | -0.005 |  |
| 6.679999999999136 | -0.011 | -0.005 |  |
| 6.659999999999136 | -0.011 | -0.005 |  |
| 6.639999999999137 | -0.011 | -0.005 |  |
| 6.619999999999137 | -0.011 | -0.005 |  |
| 6.599999999999138 | -0.011 | -0.005 |  |
| 6.579999999999138 | -0.012 | -0.005 |  |
| 6.559999999999138 | -0.012 | -0.005 |  |
| 6.53999999999914 | -0.012 | -0.005 |  |
| 6.51999999999914 | -0.012 | -0.005 |  |
| 6.49999999999914 | -0.012 | -0.005 |  |
| 6.47999999999914 | -0.012 | -0.005 |  |
| 6.45999999999914 | -0.012 | -0.005 |  |
| 6.43999999999914 | -0.012 | -0.005 |  |
| 6.419999999999141 | -0.012 | -0.005 |  |
| 6.399999999999142 | -0.012 | -0.005 |  |
| 6.379999999999142 | -0.012 | -0.005 |  |
| 6.359999999999143 | -0.012 | -0.006 |  |
| 6.339999999999143 | -0.012 | -0.006 |  |
| 6.319999999999144 | -0.013 | -0.006 |  |
| 6.299999999999144 | -0.013 | -0.006 |  |
| 6.279999999999144 | -0.013 | -0.006 |  |
| 6.259999999999145 | -0.013 | -0.006 |  |
| 6.239999999999145 | -0.013 | -0.006 |  |
| 6.219999999999146 | -0.013 | -0.006 |  |
| 6.199999999999146 | -0.013 | -0.006 |  |
| 6.179999999999147 | -0.013 | -0.006 |  |
| 6.159999999999147 | -0.013 | -0.006 |  |
| 6.139999999999147 | -0.013 | -0.006 |  |
| 6.119999999999148 | -0.013 | -0.006 |  |
| 6.099999999999148 | -0.013 | -0.006 |  |
| 6.07999999999915 | -0.014 | -0.006 |  |
| 6.05999999999915 | -0.014 | -0.006 |  |
| 6.03999999999915 | -0.014 | -0.006 |  |
| 6.01999999999915 | -0.014 | -0.006 |  |
| 5.99999999999915 | -0.014 | -0.006 |  |
| 5.97999999999915 | -0.014 | -0.006 |  |
| 5.959999999999151 | -0.014 | -0.006 |  |
| 5.939999999999152 | -0.014 | -0.006 |  |
| 5.919999999999152 | -0.014 | -0.006 |  |
| 5.899999999999153 | -0.014 | -0.006 |  |
| 5.879999999999153 | -0.014 | -0.006 |  |
| 5.859999999999154 | -0.015 | -0.006 |  |
| 5.839999999999154 | -0.015 | -0.006 |  |
| 5.819999999999154 | -0.015 | -0.006 |  |
| 5.799999999999155 | -0.015 | -0.006 |  |
| 5.779999999999155 | -0.015 | -0.006 |  |
| 5.759999999999155 | -0.015 | -0.006 |  |
| 5.739999999999156 | -0.015 | -0.006 |  |
| 5.719999999999156 | -0.015 | -0.006 |  |
| 5.699999999999157 | -0.015 | -0.006 |  |
| 5.679999999999157 | -0.015 | -0.006 |  |
| 5.659999999999158 | -0.016 | -0.006 |  |
| 5.639999999999158 | -0.016 | -0.006 |  |
| 5.619999999999159 | -0.016 | -0.006 |  |
| 5.59999999999916 | -0.016 | -0.006 |  |
| 5.57999999999916 | -0.016 | -0.006 |  |
| 5.55999999999916 | -0.016 | -0.006 |  |
| 5.53999999999916 | -0.016 | -0.006 |  |
| 5.51999999999916 | -0.016 | -0.006 |  |
| 5.49999999999916 | -0.017 | -0.006 |  |
| 5.47999999999916 | -0.017 | -0.006 |  |
| 5.459999999999162 | -0.017 | -0.006 |  |
| 5.439999999999162 | -0.017 | -0.006 |  |
| 5.419999999999163 | -0.017 | -0.006 |  |
| 5.399999999999163 | -0.017 | -0.006 |  |
| 5.379999999999164 | -0.017 | -0.006 |  |
| 5.359999999999164 | -0.017 | -0.006 |  |
| 5.339999999999164 | -0.018 | -0.006 |  |
| 5.319999999999165 | -0.018 | -0.006 |  |
| 5.299999999999165 | -0.018 | -0.006 |  |
| 5.279999999999166 | -0.018 | -0.006 |  |
| 5.259999999999166 | -0.018 | -0.006 |  |
| 5.239999999999167 | -0.018 | -0.006 |  |
| 5.219999999999167 | -0.018 | -0.006 |  |
| 5.199999999999167 | -0.018 | -0.006 |  |
| 5.179999999999168 | -0.019 | -0.006 |  |
| 5.159999999999168 | -0.019 | -0.006 |  |
| 5.13999999999917 | -0.019 | -0.006 |  |
| 5.11999999999917 | -0.019 | -0.006 |  |
| 5.09999999999917 | -0.019 | -0.006 |  |
| 5.07999999999917 | -0.019 | -0.006 |  |
| 5.05999999999917 | -0.02 | -0.006 |  |
| 5.03999999999917 | -0.02 | -0.006 |  |
| 5.019999999999171 | -0.02 | -0.006 |  |
| 4.999999999999172 | -0.02 | -0.006 |  |
| 4.979999999999172 | -0.02 | -0.006 |  |
| 4.959999999999173 | -0.02 | -0.006 |  |
| 4.939999999999173 | -0.02 | -0.006 |  |
| 4.919999999999173 | -0.021 | -0.006 |  |
| 4.899999999999174 | -0.021 | -0.006 |  |
| 4.879999999999174 | -0.021 | -0.006 |  |
| 4.859999999999175 | -0.021 | -0.006 |  |
| 4.839999999999175 | -0.021 | -0.006 |  |
| 4.819999999999176 | -0.022 | -0.006 |  |
| 4.799999999999176 | -0.022 | -0.006 |  |
| 4.779999999999176 | -0.022 | -0.006 |  |
| 4.759999999999177 | -0.022 | -0.006 |  |
| 4.739999999999177 | -0.022 | -0.006 |  |
| 4.719999999999178 | -0.022 | -0.006 |  |
| 4.699999999999178 | -0.023 | -0.006 |  |
| 4.679999999999178 | -0.023 | -0.006 |  |
| 4.65999999999918 | -0.023 | -0.006 |  |
| 4.63999999999918 | -0.023 | -0.006 |  |
| 4.61999999999918 | -0.023 | -0.006 |  |
| 4.59999999999918 | -0.024 | -0.006 |  |
| 4.57999999999918 | -0.024 | -0.006 |  |
| 4.559999999999181 | -0.024 | -0.006 |  |
| 4.539999999999182 | -0.024 | -0.006 |  |
| 4.519999999999182 | -0.024 | -0.006 |  |
| 4.499999999999182 | -0.025 | -0.006 |  |
| 4.479999999999183 | -0.025 | -0.006 |  |
| 4.459999999999183 | -0.025 | -0.006 |  |
| 4.439999999999184 | -0.025 | -0.006 |  |
| 4.419999999999184 | -0.026 | -0.006 |  |
| 4.399999999999184 | -0.026 | -0.006 |  |
| 4.379999999999185 | -0.026 | -0.006 |  |
| 4.359999999999185 | -0.026 | -0.006 |  |
| 4.339999999999186 | -0.027 | -0.006 |  |
| 4.319999999999186 | -0.027 | -0.006 |  |
| 4.299999999999187 | -0.027 | -0.006 |  |
| 4.279999999999187 | -0.027 | -0.006 |  |
| 4.259999999999187 | -0.028 | -0.006 |  |
| 4.239999999999188 | -0.028 | -0.006 |  |
| 4.219999999999188 | -0.028 | -0.006 |  |
| 4.19999999999919 | -0.028 | -0.006 |  |
| 4.17999999999919 | -0.029 | -0.006 |  |
| 4.15999999999919 | -0.029 | -0.006 |  |
| 4.13999999999919 | -0.029 | -0.006 |  |
| 4.119999999999191 | -0.029 | -0.006 |  |
| 4.099999999999191 | -0.03 | -0.006 |  |
| 4.079999999999191 | -0.03 | -0.006 |  |
| 4.059999999999192 | -0.03 | -0.006 |  |
| 4.039999999999192 | -0.031 | -0.006 |  |
| 4.019999999999193 | -0.031 | -0.006 |  |
| 3.999999999999193 | -0.031 | -0.006 |  |
| 3.979999999999193 | -0.032 | -0.006 |  |
| 3.959999999999193 | -0.032 | -0.006 |  |
| 3.939999999999193 | -0.032 | -0.006 |  |
| 3.919999999999193 | -0.033 | -0.006 |  |
| 3.899999999999193 | -0.033 | -0.006 |  |
| 3.879999999999193 | -0.033 | -0.006 |  |
| 3.859999999999193 | -0.034 | -0.006 |  |
| 3.839999999999193 | -0.034 | -0.005 |  |
| 3.819999999999193 | -0.034 | -0.005 |  |
| 3.799999999999193 | -0.035 | -0.005 |  |
| 3.779999999999193 | -0.035 | -0.005 |  |
| 3.759999999999193 | -0.035 | -0.005 |  |
| 3.739999999999193 | -0.036 | -0.005 |  |
| 3.719999999999193 | -0.036 | -0.005 |  |
| 3.699999999999193 | -0.037 | -0.005 |  |
| 3.679999999999193 | -0.037 | -0.005 |  |
| 3.659999999999193 | -0.037 | -0.005 |  |
| 3.639999999999193 | -0.038 | -0.005 |  |
| 3.619999999999193 | -0.038 | -0.005 |  |
| 3.599999999999193 | -0.039 | -0.005 |  |
| 3.579999999999193 | -0.039 | -0.005 |  |
| 3.559999999999193 | -0.039 | -0.004 |  |
| 3.539999999999193 | -0.04 | -0.004 |  |
| 3.519999999999193 | -0.04 | -0.004 |  |
| 3.499999999999193 | -0.041 | -0.004 |  |
| 3.479999999999193 | -0.041 | -0.004 |  |
| 3.459999999999193 | -0.042 | -0.004 |  |
| 3.439999999999193 | -0.042 | -0.004 |  |
| 3.419999999999193 | -0.043 | -0.004 |  |
| 3.399999999999192 | -0.043 | -0.004 |  |
| 3.379999999999192 | -0.044 | -0.003 |  |
| 3.359999999999192 | -0.044 | -0.003 |  |
| 3.339999999999192 | -0.045 | -0.003 |  |
| 3.319999999999192 | -0.045 | -0.003 |  |
| 3.299999999999192 | -0.046 | -0.003 |  |
| 3.279999999999192 | -0.046 | -0.003 |  |
| 3.259999999999192 | -0.047 | -0.003 |  |
| 3.239999999999192 | -0.048 | -0.002 |  |
| 3.219999999999192 | -0.048 | -0.002 |  |
| 3.199999999999192 | -0.049 | -0.002 |  |
| 3.179999999999192 | -0.049 | -0.002 |  |
| 3.159999999999192 | -0.05 | -0.002 |  |
| 3.139999999999192 | -0.051 | -0.002 |  |
| 3.119999999999192 | -0.051 | -0.001 |  |
| 3.099999999999192 | -0.052 | -0.001 |  |
| 3.079999999999192 | -0.053 | -0.001 |  |
| 3.059999999999192 | -0.053 | -0.001 |  |
| 3.039999999999192 | -0.054 | 0 |  |
| 3.019999999999192 | -0.055 | 0 |  |
| 2.999999999999192 | -0.056 | 0 |  |
| 2.979999999999192 | -0.056 | 0 |  |
| 2.959999999999192 | -0.057 | 0.001 |  |
| 2.939999999999192 | -0.058 | 0.001 |  |
| 2.919999999999192 | -0.059 | 0.001 |  |
| 2.899999999999192 | -0.059 | 0.001 |  |
| 2.879999999999192 | -0.06 | 0.002 |  |
| 2.859999999999192 | -0.061 | 0.002 |  |
| 2.839999999999192 | -0.062 | 0.002 |  |
| 2.819999999999192 | -0.063 | 0.003 |  |
| 2.799999999999192 | -0.064 | 0.003 |  |
| 2.779999999999192 | -0.065 | 0.003 |  |
| 2.759999999999192 | -0.066 | 0.004 |  |
| 2.739999999999192 | -0.067 | 0.004 |  |
| 2.719999999999192 | -0.068 | 0.004 |  |
| 2.699999999999192 | -0.069 | 0.005 |  |
| 2.679999999999192 | -0.07 | 0.005 |  |
| 2.659999999999192 | -0.071 | 0.006 |  |
| 2.639999999999192 | -0.072 | 0.006 |  |
| 2.619999999999192 | -0.073 | 0.007 |  |
| 2.599999999999192 | -0.074 | 0.007 |  |
| 2.579999999999192 | -0.075 | 0.007 |  |
| 2.559999999999192 | -0.076 | 0.008 |  |
| 2.539999999999192 | -0.078 | 0.009 |  |
| 2.519999999999192 | -0.079 | 0.009 |  |
| 2.499999999999192 | -0.08 | 0.01 |  |
| 2.479999999999192 | -0.081 | 0.01 |  |
| 2.459999999999192 | -0.083 | 0.011 |  |
| 2.439999999999192 | -0.084 | 0.011 |  |
| 2.419999999999192 | -0.085 | 0.012 |  |
| 2.399999999999192 | -0.087 | 0.013 |  |
| 2.379999999999192 | -0.088 | 0.013 |  |
| 2.359999999999192 | -0.09 | 0.014 |  |
| 2.339999999999192 | -0.091 | 0.015 |  |
| 2.319999999999192 | -0.093 | 0.015 |  |
| 2.299999999999192 | -0.095 | 0.016 |  |
| 2.279999999999192 | -0.096 | 0.017 |  |
| 2.259999999999192 | -0.098 | 0.018 |  |
| 2.239999999999192 | -0.1 | 0.019 |  |
| 2.219999999999191 | -0.101 | 0.02 |  |
| 2.199999999999191 | -0.103 | 0.02 |  |
| 2.179999999999191 | -0.105 | 0.021 |  |
| 2.159999999999191 | -0.107 | 0.022 |  |
| 2.139999999999191 | -0.109 | 0.023 |  |
| 2.119999999999191 | -0.111 | 0.024 |  |
| 2.099999999999191 | -0.113 | 0.025 |  |
| 2.079999999999191 | -0.116 | 0.027 |  |
| 2.059999999999191 | -0.118 | 0.028 |  |
| 2.039999999999191 | -0.12 | 0.029 |  |
| 2.019999999999191 | -0.123 | 0.03 |  |
| 1.999999999999191 | -0.125 | 0.031 |  |
| 1.979999999999191 | -0.128 | 0.033 |  |
| 1.959999999999191 | -0.13 | 0.034 |  |
| 1.939999999999191 | -0.133 | 0.035 |  |
| 1.919999999999191 | -0.136 | 0.037 |  |
| 1.899999999999191 | -0.139 | 0.038 |  |
| 1.879999999999191 | -0.141 | 0.039 |  |
| 1.859999999999191 | -0.145 | 0.041 |  |
| 1.839999999999191 | -0.148 | 0.043 |  |
| 1.819999999999191 | -0.151 | 0.044 |  |
| 1.799999999999191 | -0.154 | 0.046 |  |
| 1.779999999999191 | -0.158 | 0.047 |  |
| 1.759999999999191 | -0.161 | 0.049 |  |
| 1.739999999999191 | -0.165 | 0.051 |  |
| 1.719999999999191 | -0.169 | 0.053 |  |
| 1.699999999999191 | -0.173 | 0.054 |  |
| 1.679999999999191 | -0.177 | 0.056 |  |
| 1.659999999999191 | -0.181 | 0.058 |  |
| 1.639999999999191 | -0.186 | 0.06 |  |
| 1.619999999999191 | -0.191 | 0.062 |  |
| 1.599999999999191 | -0.195 | 0.064 |  |
| 1.579999999999191 | -0.2 | 0.066 |  |
| 1.559999999999191 | -0.205 | 0.068 |  |
| 1.539999999999191 | -0.211 | 0.07 |  |
| 1.519999999999191 | -0.216 | 0.072 |  |
| 1.499999999999191 | -0.222 | 0.074 |  |
| 1.479999999999191 | -0.228 | 0.076 |  |
| 1.459999999999191 | -0.235 | 0.078 |  |
| 1.439999999999191 | -0.241 | 0.08 |  |
| 1.419999999999191 | -0.248 | 0.082 |  |
| 1.399999999999191 | -0.255 | 0.083 |  |
| 1.379999999999191 | -0.263 | 0.085 |  |
| 1.359999999999191 | -0.27 | 0.086 |  |
| 1.339999999999191 | -0.278 | 0.088 |  |
| 1.319999999999191 | -0.287 | 0.089 |  |
| 1.299999999999191 | -0.296 | 0.089 |  |
| 1.279999999999191 | -0.305 | 0.09 |  |
| 1.259999999999191 | -0.315 | 0.09 |  |
| 1.239999999999191 | -0.325 | 0.089 |  |
| 1.219999999999191 | -0.336 | 0.088 |  |
| 1.199999999999191 | -0.347 | 0.087 |  |
| 1.179999999999191 | -0.359 | 0.084 |  |
| 1.159999999999191 | -0.372 | 0.081 |  |
| 1.139999999999191 | -0.385 | 0.077 |  |
| 1.119999999999191 | -0.399 | 0.072 |  |
| 1.09999999999919 | -0.413 | 0.065 |  |
| 1.07999999999919 | -0.429 | 0.056 |  |
| 1.05999999999919 | -0.445 | 0.046 |  |
| 1.03999999999919 | -0.462 | 0.034 |  |
| 1.01999999999919 | -0.481 | 0.018 |  |
| 0.99999999999919 | -0.5 | 0 |  |